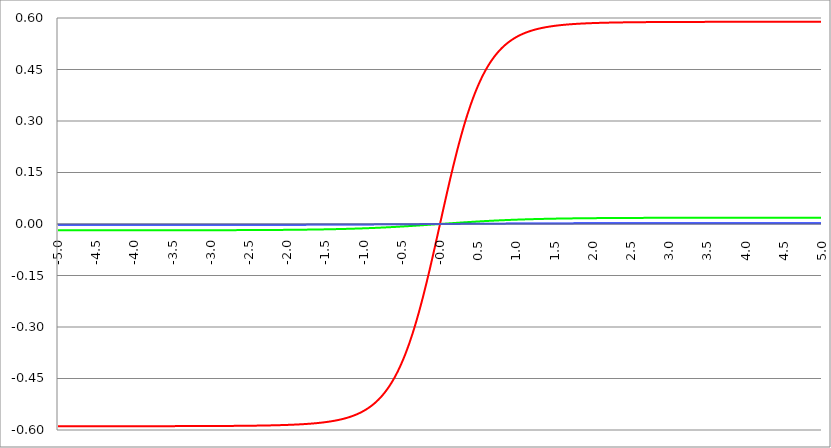
| Category | Series 1 | Series 0 | Series 2 |
|---|---|---|---|
| -5.0 | -0.589 | -0.018 | -0.002 |
| -4.995 | -0.589 | -0.018 | -0.002 |
| -4.99 | -0.589 | -0.018 | -0.002 |
| -4.985 | -0.589 | -0.018 | -0.002 |
| -4.98 | -0.589 | -0.018 | -0.002 |
| -4.975 | -0.589 | -0.018 | -0.002 |
| -4.97 | -0.589 | -0.018 | -0.002 |
| -4.965000000000001 | -0.589 | -0.018 | -0.002 |
| -4.960000000000001 | -0.589 | -0.018 | -0.002 |
| -4.955000000000001 | -0.589 | -0.018 | -0.002 |
| -4.950000000000001 | -0.589 | -0.018 | -0.002 |
| -4.945000000000001 | -0.589 | -0.018 | -0.002 |
| -4.940000000000001 | -0.589 | -0.018 | -0.002 |
| -4.935000000000001 | -0.589 | -0.018 | -0.002 |
| -4.930000000000001 | -0.589 | -0.018 | -0.002 |
| -4.925000000000002 | -0.589 | -0.018 | -0.002 |
| -4.920000000000002 | -0.589 | -0.018 | -0.002 |
| -4.915000000000002 | -0.589 | -0.018 | -0.002 |
| -4.910000000000002 | -0.589 | -0.018 | -0.002 |
| -4.905000000000002 | -0.589 | -0.018 | -0.002 |
| -4.900000000000002 | -0.589 | -0.018 | -0.002 |
| -4.895000000000002 | -0.589 | -0.018 | -0.002 |
| -4.890000000000002 | -0.589 | -0.018 | -0.002 |
| -4.885000000000002 | -0.589 | -0.018 | -0.002 |
| -4.880000000000002 | -0.589 | -0.018 | -0.002 |
| -4.875000000000003 | -0.589 | -0.018 | -0.002 |
| -4.870000000000003 | -0.589 | -0.018 | -0.002 |
| -4.865000000000003 | -0.589 | -0.018 | -0.002 |
| -4.860000000000003 | -0.589 | -0.018 | -0.002 |
| -4.855000000000003 | -0.589 | -0.018 | -0.002 |
| -4.850000000000003 | -0.589 | -0.018 | -0.002 |
| -4.845000000000003 | -0.589 | -0.018 | -0.002 |
| -4.840000000000003 | -0.589 | -0.018 | -0.002 |
| -4.835000000000003 | -0.589 | -0.018 | -0.002 |
| -4.830000000000004 | -0.589 | -0.018 | -0.002 |
| -4.825000000000004 | -0.589 | -0.018 | -0.002 |
| -4.820000000000004 | -0.589 | -0.018 | -0.002 |
| -4.815000000000004 | -0.589 | -0.018 | -0.002 |
| -4.810000000000004 | -0.589 | -0.018 | -0.002 |
| -4.805000000000004 | -0.589 | -0.018 | -0.002 |
| -4.800000000000004 | -0.589 | -0.018 | -0.002 |
| -4.795000000000004 | -0.589 | -0.018 | -0.002 |
| -4.790000000000004 | -0.589 | -0.018 | -0.002 |
| -4.785000000000004 | -0.589 | -0.018 | -0.002 |
| -4.780000000000004 | -0.589 | -0.018 | -0.002 |
| -4.775000000000004 | -0.589 | -0.018 | -0.002 |
| -4.770000000000004 | -0.589 | -0.018 | -0.002 |
| -4.765000000000005 | -0.589 | -0.018 | -0.002 |
| -4.760000000000005 | -0.589 | -0.018 | -0.002 |
| -4.755000000000005 | -0.589 | -0.018 | -0.002 |
| -4.750000000000005 | -0.589 | -0.018 | -0.002 |
| -4.745000000000005 | -0.589 | -0.018 | -0.002 |
| -4.740000000000005 | -0.589 | -0.018 | -0.002 |
| -4.735000000000005 | -0.589 | -0.018 | -0.002 |
| -4.730000000000005 | -0.589 | -0.018 | -0.002 |
| -4.725000000000006 | -0.589 | -0.018 | -0.002 |
| -4.720000000000006 | -0.589 | -0.018 | -0.002 |
| -4.715000000000006 | -0.589 | -0.018 | -0.002 |
| -4.710000000000006 | -0.589 | -0.018 | -0.002 |
| -4.705000000000006 | -0.589 | -0.018 | -0.002 |
| -4.700000000000006 | -0.589 | -0.018 | -0.002 |
| -4.695000000000006 | -0.589 | -0.018 | -0.002 |
| -4.690000000000006 | -0.589 | -0.018 | -0.002 |
| -4.685000000000007 | -0.589 | -0.018 | -0.002 |
| -4.680000000000007 | -0.589 | -0.018 | -0.002 |
| -4.675000000000007 | -0.589 | -0.018 | -0.002 |
| -4.670000000000007 | -0.589 | -0.018 | -0.002 |
| -4.665000000000007 | -0.589 | -0.018 | -0.002 |
| -4.660000000000007 | -0.589 | -0.018 | -0.002 |
| -4.655000000000007 | -0.589 | -0.018 | -0.002 |
| -4.650000000000007 | -0.589 | -0.018 | -0.002 |
| -4.645000000000007 | -0.589 | -0.018 | -0.002 |
| -4.640000000000008 | -0.589 | -0.018 | -0.002 |
| -4.635000000000008 | -0.589 | -0.018 | -0.002 |
| -4.630000000000008 | -0.589 | -0.018 | -0.002 |
| -4.625000000000008 | -0.589 | -0.018 | -0.002 |
| -4.620000000000008 | -0.589 | -0.018 | -0.002 |
| -4.615000000000008 | -0.589 | -0.018 | -0.002 |
| -4.610000000000008 | -0.589 | -0.018 | -0.002 |
| -4.605000000000008 | -0.589 | -0.018 | -0.002 |
| -4.600000000000008 | -0.589 | -0.018 | -0.002 |
| -4.595000000000009 | -0.589 | -0.018 | -0.002 |
| -4.590000000000009 | -0.589 | -0.018 | -0.002 |
| -4.585000000000009 | -0.589 | -0.018 | -0.002 |
| -4.580000000000009 | -0.589 | -0.018 | -0.002 |
| -4.57500000000001 | -0.589 | -0.018 | -0.002 |
| -4.57000000000001 | -0.589 | -0.018 | -0.002 |
| -4.565000000000009 | -0.589 | -0.018 | -0.002 |
| -4.560000000000009 | -0.589 | -0.018 | -0.002 |
| -4.555000000000009 | -0.589 | -0.018 | -0.002 |
| -4.55000000000001 | -0.589 | -0.018 | -0.002 |
| -4.54500000000001 | -0.589 | -0.018 | -0.002 |
| -4.54000000000001 | -0.589 | -0.018 | -0.002 |
| -4.53500000000001 | -0.589 | -0.018 | -0.002 |
| -4.53000000000001 | -0.589 | -0.018 | -0.002 |
| -4.52500000000001 | -0.589 | -0.018 | -0.002 |
| -4.52000000000001 | -0.589 | -0.018 | -0.002 |
| -4.51500000000001 | -0.589 | -0.018 | -0.002 |
| -4.51000000000001 | -0.589 | -0.018 | -0.002 |
| -4.505000000000011 | -0.589 | -0.018 | -0.002 |
| -4.500000000000011 | -0.589 | -0.018 | -0.002 |
| -4.495000000000011 | -0.589 | -0.018 | -0.002 |
| -4.490000000000011 | -0.589 | -0.018 | -0.002 |
| -4.485000000000011 | -0.589 | -0.018 | -0.002 |
| -4.480000000000011 | -0.589 | -0.018 | -0.002 |
| -4.475000000000011 | -0.589 | -0.018 | -0.002 |
| -4.470000000000011 | -0.589 | -0.018 | -0.002 |
| -4.465000000000011 | -0.589 | -0.018 | -0.002 |
| -4.460000000000011 | -0.589 | -0.018 | -0.002 |
| -4.455000000000012 | -0.589 | -0.018 | -0.002 |
| -4.450000000000012 | -0.589 | -0.018 | -0.002 |
| -4.445000000000012 | -0.589 | -0.018 | -0.002 |
| -4.440000000000012 | -0.589 | -0.018 | -0.002 |
| -4.435000000000012 | -0.589 | -0.018 | -0.002 |
| -4.430000000000012 | -0.589 | -0.018 | -0.002 |
| -4.425000000000012 | -0.589 | -0.018 | -0.002 |
| -4.420000000000012 | -0.589 | -0.018 | -0.002 |
| -4.415000000000012 | -0.589 | -0.018 | -0.002 |
| -4.410000000000013 | -0.589 | -0.018 | -0.002 |
| -4.405000000000013 | -0.589 | -0.018 | -0.002 |
| -4.400000000000013 | -0.589 | -0.018 | -0.002 |
| -4.395000000000013 | -0.589 | -0.018 | -0.002 |
| -4.390000000000013 | -0.589 | -0.018 | -0.002 |
| -4.385000000000013 | -0.589 | -0.018 | -0.002 |
| -4.380000000000013 | -0.589 | -0.018 | -0.002 |
| -4.375000000000013 | -0.589 | -0.018 | -0.002 |
| -4.370000000000013 | -0.589 | -0.018 | -0.002 |
| -4.365000000000013 | -0.589 | -0.018 | -0.002 |
| -4.360000000000014 | -0.589 | -0.018 | -0.002 |
| -4.355000000000014 | -0.589 | -0.018 | -0.002 |
| -4.350000000000014 | -0.589 | -0.018 | -0.002 |
| -4.345000000000014 | -0.589 | -0.018 | -0.002 |
| -4.340000000000014 | -0.589 | -0.018 | -0.002 |
| -4.335000000000014 | -0.589 | -0.018 | -0.002 |
| -4.330000000000014 | -0.589 | -0.018 | -0.002 |
| -4.325000000000014 | -0.589 | -0.018 | -0.002 |
| -4.320000000000014 | -0.589 | -0.018 | -0.002 |
| -4.315000000000015 | -0.589 | -0.018 | -0.002 |
| -4.310000000000015 | -0.589 | -0.018 | -0.002 |
| -4.305000000000015 | -0.589 | -0.018 | -0.002 |
| -4.300000000000015 | -0.589 | -0.018 | -0.002 |
| -4.295000000000015 | -0.589 | -0.018 | -0.002 |
| -4.290000000000015 | -0.589 | -0.018 | -0.002 |
| -4.285000000000015 | -0.589 | -0.018 | -0.002 |
| -4.280000000000015 | -0.589 | -0.018 | -0.002 |
| -4.275000000000015 | -0.589 | -0.018 | -0.002 |
| -4.270000000000015 | -0.589 | -0.018 | -0.002 |
| -4.265000000000016 | -0.589 | -0.018 | -0.002 |
| -4.260000000000016 | -0.589 | -0.018 | -0.002 |
| -4.255000000000016 | -0.589 | -0.018 | -0.002 |
| -4.250000000000016 | -0.589 | -0.018 | -0.002 |
| -4.245000000000016 | -0.589 | -0.018 | -0.002 |
| -4.240000000000016 | -0.589 | -0.018 | -0.002 |
| -4.235000000000016 | -0.589 | -0.018 | -0.002 |
| -4.230000000000016 | -0.589 | -0.018 | -0.002 |
| -4.225000000000017 | -0.589 | -0.018 | -0.002 |
| -4.220000000000017 | -0.589 | -0.018 | -0.002 |
| -4.215000000000017 | -0.589 | -0.018 | -0.002 |
| -4.210000000000017 | -0.589 | -0.018 | -0.002 |
| -4.205000000000017 | -0.589 | -0.018 | -0.002 |
| -4.200000000000017 | -0.589 | -0.018 | -0.002 |
| -4.195000000000017 | -0.589 | -0.018 | -0.002 |
| -4.190000000000017 | -0.589 | -0.018 | -0.002 |
| -4.185000000000017 | -0.589 | -0.018 | -0.002 |
| -4.180000000000017 | -0.589 | -0.018 | -0.002 |
| -4.175000000000018 | -0.589 | -0.018 | -0.002 |
| -4.170000000000018 | -0.589 | -0.018 | -0.002 |
| -4.165000000000018 | -0.589 | -0.018 | -0.002 |
| -4.160000000000018 | -0.589 | -0.018 | -0.002 |
| -4.155000000000018 | -0.589 | -0.018 | -0.002 |
| -4.150000000000018 | -0.589 | -0.018 | -0.002 |
| -4.145000000000018 | -0.589 | -0.018 | -0.002 |
| -4.140000000000018 | -0.589 | -0.018 | -0.002 |
| -4.135000000000018 | -0.589 | -0.018 | -0.002 |
| -4.130000000000019 | -0.589 | -0.018 | -0.002 |
| -4.125000000000019 | -0.589 | -0.018 | -0.002 |
| -4.120000000000019 | -0.589 | -0.018 | -0.002 |
| -4.115000000000019 | -0.589 | -0.018 | -0.002 |
| -4.110000000000019 | -0.589 | -0.018 | -0.002 |
| -4.105000000000019 | -0.589 | -0.018 | -0.002 |
| -4.100000000000019 | -0.589 | -0.018 | -0.002 |
| -4.095000000000019 | -0.589 | -0.018 | -0.002 |
| -4.090000000000019 | -0.589 | -0.018 | -0.002 |
| -4.085000000000019 | -0.589 | -0.018 | -0.002 |
| -4.08000000000002 | -0.589 | -0.018 | -0.002 |
| -4.07500000000002 | -0.589 | -0.018 | -0.002 |
| -4.07000000000002 | -0.589 | -0.018 | -0.002 |
| -4.06500000000002 | -0.589 | -0.018 | -0.002 |
| -4.06000000000002 | -0.589 | -0.018 | -0.002 |
| -4.05500000000002 | -0.589 | -0.018 | -0.002 |
| -4.05000000000002 | -0.589 | -0.018 | -0.002 |
| -4.04500000000002 | -0.589 | -0.018 | -0.002 |
| -4.04000000000002 | -0.589 | -0.018 | -0.002 |
| -4.03500000000002 | -0.589 | -0.018 | -0.002 |
| -4.03000000000002 | -0.589 | -0.018 | -0.002 |
| -4.025000000000021 | -0.589 | -0.018 | -0.002 |
| -4.020000000000021 | -0.589 | -0.018 | -0.002 |
| -4.015000000000021 | -0.589 | -0.018 | -0.002 |
| -4.010000000000021 | -0.589 | -0.018 | -0.002 |
| -4.005000000000021 | -0.589 | -0.018 | -0.002 |
| -4.000000000000021 | -0.589 | -0.018 | -0.002 |
| -3.995000000000021 | -0.589 | -0.018 | -0.002 |
| -3.990000000000021 | -0.589 | -0.018 | -0.002 |
| -3.985000000000022 | -0.589 | -0.018 | -0.002 |
| -3.980000000000022 | -0.589 | -0.018 | -0.002 |
| -3.975000000000022 | -0.589 | -0.018 | -0.002 |
| -3.970000000000022 | -0.589 | -0.018 | -0.002 |
| -3.965000000000022 | -0.589 | -0.018 | -0.002 |
| -3.960000000000022 | -0.589 | -0.018 | -0.002 |
| -3.955000000000022 | -0.589 | -0.018 | -0.002 |
| -3.950000000000022 | -0.589 | -0.018 | -0.002 |
| -3.945000000000022 | -0.589 | -0.018 | -0.002 |
| -3.940000000000023 | -0.589 | -0.018 | -0.002 |
| -3.935000000000023 | -0.589 | -0.018 | -0.002 |
| -3.930000000000023 | -0.589 | -0.018 | -0.002 |
| -3.925000000000023 | -0.589 | -0.018 | -0.002 |
| -3.920000000000023 | -0.589 | -0.018 | -0.002 |
| -3.915000000000023 | -0.589 | -0.018 | -0.002 |
| -3.910000000000023 | -0.589 | -0.018 | -0.002 |
| -3.905000000000023 | -0.589 | -0.018 | -0.002 |
| -3.900000000000023 | -0.589 | -0.018 | -0.002 |
| -3.895000000000023 | -0.589 | -0.018 | -0.002 |
| -3.890000000000024 | -0.589 | -0.018 | -0.002 |
| -3.885000000000024 | -0.589 | -0.018 | -0.002 |
| -3.880000000000024 | -0.589 | -0.018 | -0.002 |
| -3.875000000000024 | -0.589 | -0.018 | -0.002 |
| -3.870000000000024 | -0.589 | -0.018 | -0.002 |
| -3.865000000000024 | -0.589 | -0.018 | -0.002 |
| -3.860000000000024 | -0.589 | -0.018 | -0.002 |
| -3.855000000000024 | -0.589 | -0.018 | -0.002 |
| -3.850000000000024 | -0.589 | -0.018 | -0.002 |
| -3.845000000000025 | -0.589 | -0.018 | -0.002 |
| -3.840000000000025 | -0.589 | -0.018 | -0.002 |
| -3.835000000000025 | -0.589 | -0.018 | -0.002 |
| -3.830000000000025 | -0.589 | -0.018 | -0.002 |
| -3.825000000000025 | -0.589 | -0.018 | -0.002 |
| -3.820000000000025 | -0.589 | -0.018 | -0.002 |
| -3.815000000000025 | -0.589 | -0.018 | -0.002 |
| -3.810000000000025 | -0.589 | -0.018 | -0.002 |
| -3.805000000000025 | -0.589 | -0.018 | -0.002 |
| -3.800000000000026 | -0.589 | -0.018 | -0.002 |
| -3.795000000000026 | -0.589 | -0.018 | -0.002 |
| -3.790000000000026 | -0.589 | -0.018 | -0.002 |
| -3.785000000000026 | -0.589 | -0.018 | -0.002 |
| -3.780000000000026 | -0.589 | -0.018 | -0.002 |
| -3.775000000000026 | -0.589 | -0.018 | -0.002 |
| -3.770000000000026 | -0.589 | -0.018 | -0.002 |
| -3.765000000000026 | -0.589 | -0.018 | -0.002 |
| -3.760000000000026 | -0.589 | -0.018 | -0.002 |
| -3.755000000000026 | -0.589 | -0.018 | -0.002 |
| -3.750000000000027 | -0.589 | -0.018 | -0.002 |
| -3.745000000000027 | -0.589 | -0.018 | -0.002 |
| -3.740000000000027 | -0.589 | -0.018 | -0.002 |
| -3.735000000000027 | -0.589 | -0.018 | -0.002 |
| -3.730000000000027 | -0.589 | -0.018 | -0.002 |
| -3.725000000000027 | -0.589 | -0.018 | -0.002 |
| -3.720000000000027 | -0.589 | -0.018 | -0.002 |
| -3.715000000000027 | -0.589 | -0.018 | -0.002 |
| -3.710000000000027 | -0.589 | -0.018 | -0.002 |
| -3.705000000000028 | -0.589 | -0.018 | -0.002 |
| -3.700000000000028 | -0.589 | -0.018 | -0.002 |
| -3.695000000000028 | -0.589 | -0.018 | -0.002 |
| -3.690000000000028 | -0.589 | -0.018 | -0.002 |
| -3.685000000000028 | -0.589 | -0.018 | -0.002 |
| -3.680000000000028 | -0.589 | -0.018 | -0.002 |
| -3.675000000000028 | -0.589 | -0.018 | -0.002 |
| -3.670000000000028 | -0.589 | -0.018 | -0.002 |
| -3.665000000000028 | -0.589 | -0.018 | -0.002 |
| -3.660000000000028 | -0.589 | -0.018 | -0.002 |
| -3.655000000000029 | -0.589 | -0.018 | -0.002 |
| -3.650000000000029 | -0.589 | -0.018 | -0.002 |
| -3.645000000000029 | -0.589 | -0.018 | -0.002 |
| -3.640000000000029 | -0.589 | -0.018 | -0.002 |
| -3.635000000000029 | -0.589 | -0.018 | -0.002 |
| -3.630000000000029 | -0.589 | -0.018 | -0.002 |
| -3.625000000000029 | -0.589 | -0.018 | -0.002 |
| -3.620000000000029 | -0.589 | -0.018 | -0.002 |
| -3.615000000000029 | -0.589 | -0.018 | -0.002 |
| -3.61000000000003 | -0.589 | -0.018 | -0.002 |
| -3.60500000000003 | -0.589 | -0.018 | -0.002 |
| -3.60000000000003 | -0.589 | -0.018 | -0.002 |
| -3.59500000000003 | -0.589 | -0.018 | -0.002 |
| -3.59000000000003 | -0.589 | -0.018 | -0.002 |
| -3.58500000000003 | -0.589 | -0.018 | -0.002 |
| -3.58000000000003 | -0.589 | -0.018 | -0.002 |
| -3.57500000000003 | -0.589 | -0.018 | -0.002 |
| -3.57000000000003 | -0.589 | -0.018 | -0.002 |
| -3.565000000000031 | -0.589 | -0.018 | -0.002 |
| -3.560000000000031 | -0.589 | -0.018 | -0.002 |
| -3.555000000000031 | -0.589 | -0.018 | -0.002 |
| -3.550000000000031 | -0.589 | -0.018 | -0.002 |
| -3.545000000000031 | -0.589 | -0.018 | -0.002 |
| -3.540000000000031 | -0.589 | -0.018 | -0.002 |
| -3.535000000000031 | -0.589 | -0.018 | -0.002 |
| -3.530000000000031 | -0.589 | -0.018 | -0.002 |
| -3.525000000000031 | -0.589 | -0.018 | -0.002 |
| -3.520000000000032 | -0.589 | -0.018 | -0.002 |
| -3.515000000000032 | -0.589 | -0.018 | -0.002 |
| -3.510000000000032 | -0.589 | -0.018 | -0.002 |
| -3.505000000000032 | -0.589 | -0.018 | -0.002 |
| -3.500000000000032 | -0.589 | -0.018 | -0.002 |
| -3.495000000000032 | -0.589 | -0.018 | -0.002 |
| -3.490000000000032 | -0.589 | -0.018 | -0.002 |
| -3.485000000000032 | -0.589 | -0.018 | -0.002 |
| -3.480000000000032 | -0.589 | -0.018 | -0.002 |
| -3.475000000000032 | -0.589 | -0.018 | -0.002 |
| -3.470000000000033 | -0.589 | -0.018 | -0.002 |
| -3.465000000000033 | -0.589 | -0.018 | -0.002 |
| -3.460000000000033 | -0.589 | -0.018 | -0.002 |
| -3.455000000000033 | -0.589 | -0.018 | -0.002 |
| -3.450000000000033 | -0.589 | -0.018 | -0.002 |
| -3.445000000000033 | -0.589 | -0.018 | -0.002 |
| -3.440000000000033 | -0.589 | -0.018 | -0.002 |
| -3.435000000000033 | -0.589 | -0.018 | -0.002 |
| -3.430000000000033 | -0.589 | -0.018 | -0.002 |
| -3.425000000000034 | -0.589 | -0.018 | -0.002 |
| -3.420000000000034 | -0.589 | -0.018 | -0.002 |
| -3.415000000000034 | -0.589 | -0.018 | -0.002 |
| -3.410000000000034 | -0.589 | -0.018 | -0.002 |
| -3.405000000000034 | -0.589 | -0.018 | -0.002 |
| -3.400000000000034 | -0.589 | -0.018 | -0.002 |
| -3.395000000000034 | -0.589 | -0.018 | -0.002 |
| -3.390000000000034 | -0.589 | -0.018 | -0.002 |
| -3.385000000000034 | -0.589 | -0.018 | -0.002 |
| -3.380000000000034 | -0.589 | -0.018 | -0.002 |
| -3.375000000000035 | -0.589 | -0.018 | -0.002 |
| -3.370000000000035 | -0.589 | -0.018 | -0.002 |
| -3.365000000000035 | -0.589 | -0.018 | -0.002 |
| -3.360000000000035 | -0.589 | -0.018 | -0.002 |
| -3.355000000000035 | -0.589 | -0.018 | -0.002 |
| -3.350000000000035 | -0.589 | -0.018 | -0.002 |
| -3.345000000000035 | -0.589 | -0.018 | -0.002 |
| -3.340000000000035 | -0.589 | -0.018 | -0.002 |
| -3.335000000000035 | -0.589 | -0.018 | -0.002 |
| -3.330000000000036 | -0.589 | -0.018 | -0.002 |
| -3.325000000000036 | -0.589 | -0.018 | -0.002 |
| -3.320000000000036 | -0.589 | -0.018 | -0.002 |
| -3.315000000000036 | -0.589 | -0.018 | -0.002 |
| -3.310000000000036 | -0.589 | -0.018 | -0.002 |
| -3.305000000000036 | -0.589 | -0.018 | -0.002 |
| -3.300000000000036 | -0.589 | -0.018 | -0.002 |
| -3.295000000000036 | -0.589 | -0.018 | -0.002 |
| -3.290000000000036 | -0.589 | -0.018 | -0.002 |
| -3.285000000000036 | -0.589 | -0.018 | -0.002 |
| -3.280000000000036 | -0.589 | -0.018 | -0.002 |
| -3.275000000000037 | -0.589 | -0.018 | -0.002 |
| -3.270000000000037 | -0.589 | -0.018 | -0.002 |
| -3.265000000000037 | -0.589 | -0.018 | -0.002 |
| -3.260000000000037 | -0.589 | -0.018 | -0.002 |
| -3.255000000000037 | -0.589 | -0.018 | -0.002 |
| -3.250000000000037 | -0.589 | -0.018 | -0.002 |
| -3.245000000000037 | -0.589 | -0.018 | -0.002 |
| -3.240000000000037 | -0.589 | -0.018 | -0.002 |
| -3.235000000000038 | -0.589 | -0.018 | -0.002 |
| -3.230000000000038 | -0.589 | -0.018 | -0.002 |
| -3.225000000000038 | -0.589 | -0.018 | -0.002 |
| -3.220000000000038 | -0.589 | -0.018 | -0.002 |
| -3.215000000000038 | -0.589 | -0.018 | -0.002 |
| -3.210000000000038 | -0.589 | -0.018 | -0.002 |
| -3.205000000000038 | -0.589 | -0.018 | -0.002 |
| -3.200000000000038 | -0.589 | -0.018 | -0.002 |
| -3.195000000000038 | -0.589 | -0.018 | -0.002 |
| -3.190000000000039 | -0.589 | -0.018 | -0.002 |
| -3.185000000000039 | -0.589 | -0.018 | -0.002 |
| -3.180000000000039 | -0.589 | -0.018 | -0.002 |
| -3.175000000000039 | -0.589 | -0.018 | -0.002 |
| -3.170000000000039 | -0.589 | -0.018 | -0.002 |
| -3.16500000000004 | -0.589 | -0.018 | -0.002 |
| -3.16000000000004 | -0.589 | -0.018 | -0.002 |
| -3.155000000000039 | -0.589 | -0.018 | -0.002 |
| -3.150000000000039 | -0.589 | -0.018 | -0.002 |
| -3.14500000000004 | -0.589 | -0.018 | -0.002 |
| -3.14000000000004 | -0.589 | -0.018 | -0.002 |
| -3.13500000000004 | -0.589 | -0.018 | -0.002 |
| -3.13000000000004 | -0.589 | -0.018 | -0.002 |
| -3.12500000000004 | -0.589 | -0.018 | -0.002 |
| -3.12000000000004 | -0.589 | -0.018 | -0.002 |
| -3.11500000000004 | -0.588 | -0.018 | -0.002 |
| -3.11000000000004 | -0.588 | -0.018 | -0.002 |
| -3.10500000000004 | -0.588 | -0.018 | -0.002 |
| -3.10000000000004 | -0.588 | -0.018 | -0.002 |
| -3.095000000000041 | -0.588 | -0.018 | -0.002 |
| -3.090000000000041 | -0.588 | -0.018 | -0.002 |
| -3.085000000000041 | -0.588 | -0.018 | -0.002 |
| -3.080000000000041 | -0.588 | -0.018 | -0.002 |
| -3.075000000000041 | -0.588 | -0.018 | -0.002 |
| -3.070000000000041 | -0.588 | -0.018 | -0.002 |
| -3.065000000000041 | -0.588 | -0.018 | -0.002 |
| -3.060000000000041 | -0.588 | -0.018 | -0.002 |
| -3.055000000000041 | -0.588 | -0.018 | -0.002 |
| -3.050000000000042 | -0.588 | -0.018 | -0.002 |
| -3.045000000000042 | -0.588 | -0.018 | -0.002 |
| -3.040000000000042 | -0.588 | -0.018 | -0.002 |
| -3.035000000000042 | -0.588 | -0.018 | -0.002 |
| -3.030000000000042 | -0.588 | -0.018 | -0.002 |
| -3.025000000000042 | -0.588 | -0.018 | -0.002 |
| -3.020000000000042 | -0.588 | -0.018 | -0.002 |
| -3.015000000000042 | -0.588 | -0.018 | -0.002 |
| -3.010000000000042 | -0.588 | -0.018 | -0.002 |
| -3.005000000000043 | -0.588 | -0.018 | -0.002 |
| -3.000000000000043 | -0.588 | -0.018 | -0.002 |
| -2.995000000000043 | -0.588 | -0.018 | -0.002 |
| -2.990000000000043 | -0.588 | -0.018 | -0.002 |
| -2.985000000000043 | -0.588 | -0.018 | -0.002 |
| -2.980000000000043 | -0.588 | -0.018 | -0.002 |
| -2.975000000000043 | -0.588 | -0.018 | -0.002 |
| -2.970000000000043 | -0.588 | -0.018 | -0.002 |
| -2.965000000000043 | -0.588 | -0.018 | -0.002 |
| -2.960000000000043 | -0.588 | -0.018 | -0.002 |
| -2.955000000000044 | -0.588 | -0.018 | -0.002 |
| -2.950000000000044 | -0.588 | -0.018 | -0.002 |
| -2.945000000000044 | -0.588 | -0.018 | -0.002 |
| -2.940000000000044 | -0.588 | -0.018 | -0.002 |
| -2.935000000000044 | -0.588 | -0.018 | -0.002 |
| -2.930000000000044 | -0.588 | -0.018 | -0.002 |
| -2.925000000000044 | -0.588 | -0.018 | -0.002 |
| -2.920000000000044 | -0.588 | -0.018 | -0.002 |
| -2.915000000000044 | -0.588 | -0.018 | -0.002 |
| -2.910000000000045 | -0.588 | -0.018 | -0.002 |
| -2.905000000000045 | -0.588 | -0.018 | -0.002 |
| -2.900000000000045 | -0.588 | -0.018 | -0.002 |
| -2.895000000000045 | -0.588 | -0.018 | -0.002 |
| -2.890000000000045 | -0.588 | -0.018 | -0.002 |
| -2.885000000000045 | -0.588 | -0.018 | -0.002 |
| -2.880000000000045 | -0.588 | -0.018 | -0.002 |
| -2.875000000000045 | -0.588 | -0.018 | -0.002 |
| -2.870000000000045 | -0.588 | -0.018 | -0.002 |
| -2.865000000000045 | -0.588 | -0.018 | -0.002 |
| -2.860000000000046 | -0.588 | -0.018 | -0.002 |
| -2.855000000000046 | -0.588 | -0.018 | -0.002 |
| -2.850000000000046 | -0.588 | -0.018 | -0.002 |
| -2.845000000000046 | -0.588 | -0.018 | -0.002 |
| -2.840000000000046 | -0.588 | -0.018 | -0.002 |
| -2.835000000000046 | -0.588 | -0.018 | -0.002 |
| -2.830000000000046 | -0.588 | -0.018 | -0.002 |
| -2.825000000000046 | -0.588 | -0.018 | -0.002 |
| -2.820000000000046 | -0.588 | -0.018 | -0.002 |
| -2.815000000000047 | -0.588 | -0.018 | -0.002 |
| -2.810000000000047 | -0.588 | -0.018 | -0.002 |
| -2.805000000000047 | -0.588 | -0.018 | -0.002 |
| -2.800000000000047 | -0.588 | -0.018 | -0.002 |
| -2.795000000000047 | -0.588 | -0.018 | -0.002 |
| -2.790000000000047 | -0.588 | -0.018 | -0.002 |
| -2.785000000000047 | -0.588 | -0.018 | -0.002 |
| -2.780000000000047 | -0.588 | -0.018 | -0.002 |
| -2.775000000000047 | -0.588 | -0.018 | -0.002 |
| -2.770000000000047 | -0.588 | -0.018 | -0.002 |
| -2.765000000000048 | -0.588 | -0.018 | -0.002 |
| -2.760000000000048 | -0.588 | -0.018 | -0.002 |
| -2.755000000000048 | -0.588 | -0.018 | -0.002 |
| -2.750000000000048 | -0.588 | -0.018 | -0.002 |
| -2.745000000000048 | -0.588 | -0.018 | -0.002 |
| -2.740000000000048 | -0.588 | -0.018 | -0.002 |
| -2.735000000000048 | -0.588 | -0.018 | -0.002 |
| -2.730000000000048 | -0.588 | -0.018 | -0.002 |
| -2.725000000000048 | -0.588 | -0.018 | -0.002 |
| -2.720000000000049 | -0.588 | -0.018 | -0.002 |
| -2.715000000000049 | -0.588 | -0.018 | -0.002 |
| -2.710000000000049 | -0.588 | -0.018 | -0.002 |
| -2.705000000000049 | -0.588 | -0.018 | -0.002 |
| -2.700000000000049 | -0.588 | -0.018 | -0.002 |
| -2.695000000000049 | -0.588 | -0.018 | -0.002 |
| -2.690000000000049 | -0.588 | -0.018 | -0.002 |
| -2.685000000000049 | -0.588 | -0.018 | -0.002 |
| -2.680000000000049 | -0.588 | -0.018 | -0.002 |
| -2.675000000000049 | -0.588 | -0.018 | -0.002 |
| -2.67000000000005 | -0.588 | -0.018 | -0.002 |
| -2.66500000000005 | -0.588 | -0.018 | -0.002 |
| -2.66000000000005 | -0.588 | -0.018 | -0.002 |
| -2.65500000000005 | -0.588 | -0.018 | -0.002 |
| -2.65000000000005 | -0.588 | -0.018 | -0.002 |
| -2.64500000000005 | -0.588 | -0.018 | -0.002 |
| -2.64000000000005 | -0.588 | -0.018 | -0.002 |
| -2.63500000000005 | -0.588 | -0.018 | -0.002 |
| -2.63000000000005 | -0.588 | -0.018 | -0.002 |
| -2.625000000000051 | -0.588 | -0.018 | -0.002 |
| -2.620000000000051 | -0.588 | -0.018 | -0.002 |
| -2.615000000000051 | -0.588 | -0.018 | -0.002 |
| -2.610000000000051 | -0.588 | -0.018 | -0.002 |
| -2.605000000000051 | -0.588 | -0.018 | -0.002 |
| -2.600000000000051 | -0.588 | -0.018 | -0.002 |
| -2.595000000000051 | -0.588 | -0.018 | -0.002 |
| -2.590000000000051 | -0.588 | -0.018 | -0.002 |
| -2.585000000000051 | -0.588 | -0.018 | -0.002 |
| -2.580000000000052 | -0.588 | -0.018 | -0.002 |
| -2.575000000000052 | -0.588 | -0.018 | -0.002 |
| -2.570000000000052 | -0.588 | -0.018 | -0.002 |
| -2.565000000000052 | -0.588 | -0.018 | -0.002 |
| -2.560000000000052 | -0.588 | -0.018 | -0.002 |
| -2.555000000000052 | -0.588 | -0.018 | -0.002 |
| -2.550000000000052 | -0.588 | -0.018 | -0.002 |
| -2.545000000000052 | -0.588 | -0.018 | -0.002 |
| -2.540000000000052 | -0.588 | -0.018 | -0.002 |
| -2.535000000000053 | -0.588 | -0.018 | -0.002 |
| -2.530000000000053 | -0.588 | -0.018 | -0.002 |
| -2.525000000000053 | -0.588 | -0.018 | -0.002 |
| -2.520000000000053 | -0.588 | -0.018 | -0.002 |
| -2.515000000000053 | -0.588 | -0.018 | -0.002 |
| -2.510000000000053 | -0.588 | -0.018 | -0.002 |
| -2.505000000000053 | -0.588 | -0.018 | -0.002 |
| -2.500000000000053 | -0.588 | -0.018 | -0.002 |
| -2.495000000000053 | -0.588 | -0.018 | -0.002 |
| -2.490000000000053 | -0.588 | -0.018 | -0.002 |
| -2.485000000000054 | -0.588 | -0.018 | -0.002 |
| -2.480000000000054 | -0.588 | -0.018 | -0.002 |
| -2.475000000000054 | -0.587 | -0.018 | -0.002 |
| -2.470000000000054 | -0.587 | -0.018 | -0.002 |
| -2.465000000000054 | -0.587 | -0.018 | -0.002 |
| -2.460000000000054 | -0.587 | -0.018 | -0.002 |
| -2.455000000000054 | -0.587 | -0.018 | -0.002 |
| -2.450000000000054 | -0.587 | -0.018 | -0.002 |
| -2.445000000000054 | -0.587 | -0.018 | -0.002 |
| -2.440000000000055 | -0.587 | -0.018 | -0.002 |
| -2.435000000000055 | -0.587 | -0.018 | -0.002 |
| -2.430000000000055 | -0.587 | -0.018 | -0.002 |
| -2.425000000000055 | -0.587 | -0.018 | -0.002 |
| -2.420000000000055 | -0.587 | -0.018 | -0.002 |
| -2.415000000000055 | -0.587 | -0.018 | -0.002 |
| -2.410000000000055 | -0.587 | -0.018 | -0.002 |
| -2.405000000000055 | -0.587 | -0.018 | -0.002 |
| -2.400000000000055 | -0.587 | -0.018 | -0.002 |
| -2.395000000000055 | -0.587 | -0.018 | -0.002 |
| -2.390000000000056 | -0.587 | -0.018 | -0.002 |
| -2.385000000000056 | -0.587 | -0.018 | -0.002 |
| -2.380000000000056 | -0.587 | -0.018 | -0.002 |
| -2.375000000000056 | -0.587 | -0.018 | -0.002 |
| -2.370000000000056 | -0.587 | -0.018 | -0.002 |
| -2.365000000000056 | -0.587 | -0.018 | -0.002 |
| -2.360000000000056 | -0.587 | -0.018 | -0.002 |
| -2.355000000000056 | -0.587 | -0.018 | -0.002 |
| -2.350000000000056 | -0.587 | -0.018 | -0.002 |
| -2.345000000000057 | -0.587 | -0.018 | -0.002 |
| -2.340000000000057 | -0.587 | -0.018 | -0.002 |
| -2.335000000000057 | -0.587 | -0.018 | -0.002 |
| -2.330000000000057 | -0.587 | -0.018 | -0.002 |
| -2.325000000000057 | -0.587 | -0.018 | -0.002 |
| -2.320000000000057 | -0.587 | -0.018 | -0.002 |
| -2.315000000000057 | -0.587 | -0.018 | -0.002 |
| -2.310000000000057 | -0.587 | -0.018 | -0.002 |
| -2.305000000000057 | -0.587 | -0.017 | -0.002 |
| -2.300000000000058 | -0.587 | -0.017 | -0.002 |
| -2.295000000000058 | -0.587 | -0.017 | -0.002 |
| -2.290000000000058 | -0.587 | -0.017 | -0.002 |
| -2.285000000000058 | -0.587 | -0.017 | -0.002 |
| -2.280000000000058 | -0.587 | -0.017 | -0.002 |
| -2.275000000000058 | -0.587 | -0.017 | -0.002 |
| -2.270000000000058 | -0.587 | -0.017 | -0.002 |
| -2.265000000000058 | -0.587 | -0.017 | -0.002 |
| -2.260000000000058 | -0.587 | -0.017 | -0.002 |
| -2.255000000000058 | -0.587 | -0.017 | -0.002 |
| -2.250000000000059 | -0.587 | -0.017 | -0.002 |
| -2.245000000000059 | -0.587 | -0.017 | -0.002 |
| -2.240000000000059 | -0.587 | -0.017 | -0.002 |
| -2.235000000000059 | -0.587 | -0.017 | -0.002 |
| -2.23000000000006 | -0.587 | -0.017 | -0.002 |
| -2.22500000000006 | -0.587 | -0.017 | -0.002 |
| -2.22000000000006 | -0.587 | -0.017 | -0.002 |
| -2.215000000000059 | -0.587 | -0.017 | -0.002 |
| -2.210000000000059 | -0.587 | -0.017 | -0.002 |
| -2.20500000000006 | -0.586 | -0.017 | -0.002 |
| -2.20000000000006 | -0.586 | -0.017 | -0.002 |
| -2.19500000000006 | -0.586 | -0.017 | -0.002 |
| -2.19000000000006 | -0.586 | -0.017 | -0.002 |
| -2.18500000000006 | -0.586 | -0.017 | -0.002 |
| -2.18000000000006 | -0.586 | -0.017 | -0.002 |
| -2.17500000000006 | -0.586 | -0.017 | -0.002 |
| -2.17000000000006 | -0.586 | -0.017 | -0.002 |
| -2.16500000000006 | -0.586 | -0.017 | -0.002 |
| -2.160000000000061 | -0.586 | -0.017 | -0.002 |
| -2.155000000000061 | -0.586 | -0.017 | -0.002 |
| -2.150000000000061 | -0.586 | -0.017 | -0.002 |
| -2.145000000000061 | -0.586 | -0.017 | -0.002 |
| -2.140000000000061 | -0.586 | -0.017 | -0.002 |
| -2.135000000000061 | -0.586 | -0.017 | -0.002 |
| -2.130000000000061 | -0.586 | -0.017 | -0.002 |
| -2.125000000000061 | -0.586 | -0.017 | -0.002 |
| -2.120000000000061 | -0.586 | -0.017 | -0.002 |
| -2.115000000000061 | -0.586 | -0.017 | -0.002 |
| -2.110000000000062 | -0.586 | -0.017 | -0.002 |
| -2.105000000000062 | -0.586 | -0.017 | -0.002 |
| -2.100000000000062 | -0.586 | -0.017 | -0.002 |
| -2.095000000000062 | -0.586 | -0.017 | -0.002 |
| -2.090000000000062 | -0.586 | -0.017 | -0.002 |
| -2.085000000000062 | -0.586 | -0.017 | -0.002 |
| -2.080000000000062 | -0.586 | -0.017 | -0.002 |
| -2.075000000000062 | -0.586 | -0.017 | -0.002 |
| -2.070000000000062 | -0.586 | -0.017 | -0.002 |
| -2.065000000000063 | -0.586 | -0.017 | -0.002 |
| -2.060000000000063 | -0.586 | -0.017 | -0.002 |
| -2.055000000000063 | -0.586 | -0.017 | -0.002 |
| -2.050000000000063 | -0.586 | -0.017 | -0.002 |
| -2.045000000000063 | -0.586 | -0.017 | -0.002 |
| -2.040000000000063 | -0.585 | -0.017 | -0.002 |
| -2.035000000000063 | -0.585 | -0.017 | -0.002 |
| -2.030000000000063 | -0.585 | -0.017 | -0.002 |
| -2.025000000000063 | -0.585 | -0.017 | -0.002 |
| -2.020000000000064 | -0.585 | -0.017 | -0.002 |
| -2.015000000000064 | -0.585 | -0.017 | -0.002 |
| -2.010000000000064 | -0.585 | -0.017 | -0.002 |
| -2.005000000000064 | -0.585 | -0.017 | -0.002 |
| -2.000000000000064 | -0.585 | -0.017 | -0.002 |
| -1.995000000000064 | -0.585 | -0.017 | -0.002 |
| -1.990000000000064 | -0.585 | -0.017 | -0.002 |
| -1.985000000000064 | -0.585 | -0.017 | -0.002 |
| -1.980000000000064 | -0.585 | -0.017 | -0.002 |
| -1.975000000000064 | -0.585 | -0.017 | -0.002 |
| -1.970000000000065 | -0.585 | -0.017 | -0.002 |
| -1.965000000000065 | -0.585 | -0.017 | -0.002 |
| -1.960000000000065 | -0.585 | -0.017 | -0.002 |
| -1.955000000000065 | -0.585 | -0.017 | -0.002 |
| -1.950000000000065 | -0.585 | -0.017 | -0.002 |
| -1.945000000000065 | -0.585 | -0.017 | -0.002 |
| -1.940000000000065 | -0.585 | -0.017 | -0.002 |
| -1.935000000000065 | -0.585 | -0.017 | -0.002 |
| -1.930000000000065 | -0.585 | -0.017 | -0.002 |
| -1.925000000000066 | -0.585 | -0.017 | -0.002 |
| -1.920000000000066 | -0.584 | -0.017 | -0.002 |
| -1.915000000000066 | -0.584 | -0.017 | -0.002 |
| -1.910000000000066 | -0.584 | -0.017 | -0.002 |
| -1.905000000000066 | -0.584 | -0.017 | -0.002 |
| -1.900000000000066 | -0.584 | -0.017 | -0.002 |
| -1.895000000000066 | -0.584 | -0.017 | -0.002 |
| -1.890000000000066 | -0.584 | -0.017 | -0.002 |
| -1.885000000000066 | -0.584 | -0.017 | -0.002 |
| -1.880000000000066 | -0.584 | -0.017 | -0.002 |
| -1.875000000000067 | -0.584 | -0.017 | -0.002 |
| -1.870000000000067 | -0.584 | -0.017 | -0.002 |
| -1.865000000000067 | -0.584 | -0.017 | -0.002 |
| -1.860000000000067 | -0.584 | -0.017 | -0.002 |
| -1.855000000000067 | -0.584 | -0.017 | -0.002 |
| -1.850000000000067 | -0.584 | -0.017 | -0.002 |
| -1.845000000000067 | -0.584 | -0.017 | -0.002 |
| -1.840000000000067 | -0.584 | -0.017 | -0.002 |
| -1.835000000000067 | -0.584 | -0.017 | -0.002 |
| -1.830000000000068 | -0.583 | -0.017 | -0.002 |
| -1.825000000000068 | -0.583 | -0.017 | -0.002 |
| -1.820000000000068 | -0.583 | -0.017 | -0.002 |
| -1.815000000000068 | -0.583 | -0.017 | -0.002 |
| -1.810000000000068 | -0.583 | -0.017 | -0.002 |
| -1.805000000000068 | -0.583 | -0.017 | -0.002 |
| -1.800000000000068 | -0.583 | -0.017 | -0.002 |
| -1.795000000000068 | -0.583 | -0.017 | -0.002 |
| -1.790000000000068 | -0.583 | -0.017 | -0.002 |
| -1.785000000000068 | -0.583 | -0.017 | -0.002 |
| -1.780000000000069 | -0.583 | -0.017 | -0.002 |
| -1.775000000000069 | -0.583 | -0.016 | -0.002 |
| -1.770000000000069 | -0.583 | -0.016 | -0.002 |
| -1.765000000000069 | -0.583 | -0.016 | -0.002 |
| -1.760000000000069 | -0.583 | -0.016 | -0.002 |
| -1.75500000000007 | -0.582 | -0.016 | -0.002 |
| -1.75000000000007 | -0.582 | -0.016 | -0.002 |
| -1.745000000000069 | -0.582 | -0.016 | -0.002 |
| -1.740000000000069 | -0.582 | -0.016 | -0.002 |
| -1.73500000000007 | -0.582 | -0.016 | -0.002 |
| -1.73000000000007 | -0.582 | -0.016 | -0.002 |
| -1.72500000000007 | -0.582 | -0.016 | -0.002 |
| -1.72000000000007 | -0.582 | -0.016 | -0.002 |
| -1.71500000000007 | -0.582 | -0.016 | -0.002 |
| -1.71000000000007 | -0.582 | -0.016 | -0.002 |
| -1.70500000000007 | -0.582 | -0.016 | -0.002 |
| -1.70000000000007 | -0.582 | -0.016 | -0.002 |
| -1.69500000000007 | -0.582 | -0.016 | -0.002 |
| -1.69000000000007 | -0.581 | -0.016 | -0.002 |
| -1.685000000000071 | -0.581 | -0.016 | -0.002 |
| -1.680000000000071 | -0.581 | -0.016 | -0.002 |
| -1.675000000000071 | -0.581 | -0.016 | -0.002 |
| -1.670000000000071 | -0.581 | -0.016 | -0.002 |
| -1.665000000000071 | -0.581 | -0.016 | -0.002 |
| -1.660000000000071 | -0.581 | -0.016 | -0.002 |
| -1.655000000000071 | -0.581 | -0.016 | -0.002 |
| -1.650000000000071 | -0.581 | -0.016 | -0.002 |
| -1.645000000000071 | -0.581 | -0.016 | -0.002 |
| -1.640000000000072 | -0.581 | -0.016 | -0.002 |
| -1.635000000000072 | -0.58 | -0.016 | -0.002 |
| -1.630000000000072 | -0.58 | -0.016 | -0.002 |
| -1.625000000000072 | -0.58 | -0.016 | -0.002 |
| -1.620000000000072 | -0.58 | -0.016 | -0.002 |
| -1.615000000000072 | -0.58 | -0.016 | -0.002 |
| -1.610000000000072 | -0.58 | -0.016 | -0.002 |
| -1.605000000000072 | -0.58 | -0.016 | -0.002 |
| -1.600000000000072 | -0.58 | -0.016 | -0.002 |
| -1.595000000000073 | -0.58 | -0.016 | -0.002 |
| -1.590000000000073 | -0.579 | -0.016 | -0.002 |
| -1.585000000000073 | -0.579 | -0.016 | -0.002 |
| -1.580000000000073 | -0.579 | -0.016 | -0.002 |
| -1.575000000000073 | -0.579 | -0.016 | -0.002 |
| -1.570000000000073 | -0.579 | -0.016 | -0.002 |
| -1.565000000000073 | -0.579 | -0.016 | -0.002 |
| -1.560000000000073 | -0.579 | -0.016 | -0.002 |
| -1.555000000000073 | -0.579 | -0.016 | -0.002 |
| -1.550000000000074 | -0.578 | -0.016 | -0.002 |
| -1.545000000000074 | -0.578 | -0.016 | -0.002 |
| -1.540000000000074 | -0.578 | -0.016 | -0.002 |
| -1.535000000000074 | -0.578 | -0.016 | -0.002 |
| -1.530000000000074 | -0.578 | -0.016 | -0.002 |
| -1.525000000000074 | -0.578 | -0.016 | -0.002 |
| -1.520000000000074 | -0.578 | -0.016 | -0.002 |
| -1.515000000000074 | -0.578 | -0.016 | -0.002 |
| -1.510000000000074 | -0.577 | -0.016 | -0.002 |
| -1.505000000000074 | -0.577 | -0.016 | -0.002 |
| -1.500000000000075 | -0.577 | -0.016 | -0.002 |
| -1.495000000000075 | -0.577 | -0.016 | -0.002 |
| -1.490000000000075 | -0.577 | -0.016 | -0.002 |
| -1.485000000000075 | -0.577 | -0.016 | -0.002 |
| -1.480000000000075 | -0.577 | -0.015 | -0.002 |
| -1.475000000000075 | -0.576 | -0.015 | -0.002 |
| -1.470000000000075 | -0.576 | -0.015 | -0.002 |
| -1.465000000000075 | -0.576 | -0.015 | -0.002 |
| -1.460000000000075 | -0.576 | -0.015 | -0.002 |
| -1.455000000000076 | -0.576 | -0.015 | -0.002 |
| -1.450000000000076 | -0.576 | -0.015 | -0.002 |
| -1.445000000000076 | -0.575 | -0.015 | -0.002 |
| -1.440000000000076 | -0.575 | -0.015 | -0.002 |
| -1.435000000000076 | -0.575 | -0.015 | -0.002 |
| -1.430000000000076 | -0.575 | -0.015 | -0.002 |
| -1.425000000000076 | -0.575 | -0.015 | -0.002 |
| -1.420000000000076 | -0.575 | -0.015 | -0.002 |
| -1.415000000000076 | -0.574 | -0.015 | -0.002 |
| -1.410000000000077 | -0.574 | -0.015 | -0.002 |
| -1.405000000000077 | -0.574 | -0.015 | -0.002 |
| -1.400000000000077 | -0.574 | -0.015 | -0.002 |
| -1.395000000000077 | -0.574 | -0.015 | -0.002 |
| -1.390000000000077 | -0.573 | -0.015 | -0.002 |
| -1.385000000000077 | -0.573 | -0.015 | -0.002 |
| -1.380000000000077 | -0.573 | -0.015 | -0.002 |
| -1.375000000000077 | -0.573 | -0.015 | -0.002 |
| -1.370000000000077 | -0.573 | -0.015 | -0.002 |
| -1.365000000000077 | -0.572 | -0.015 | -0.002 |
| -1.360000000000078 | -0.572 | -0.015 | -0.002 |
| -1.355000000000078 | -0.572 | -0.015 | -0.002 |
| -1.350000000000078 | -0.572 | -0.015 | -0.002 |
| -1.345000000000078 | -0.571 | -0.015 | -0.002 |
| -1.340000000000078 | -0.571 | -0.015 | -0.002 |
| -1.335000000000078 | -0.571 | -0.015 | -0.002 |
| -1.330000000000078 | -0.571 | -0.015 | -0.002 |
| -1.325000000000078 | -0.571 | -0.015 | -0.002 |
| -1.320000000000078 | -0.57 | -0.015 | -0.002 |
| -1.315000000000079 | -0.57 | -0.015 | -0.002 |
| -1.310000000000079 | -0.57 | -0.015 | -0.002 |
| -1.305000000000079 | -0.57 | -0.015 | -0.002 |
| -1.300000000000079 | -0.569 | -0.015 | -0.002 |
| -1.295000000000079 | -0.569 | -0.015 | -0.002 |
| -1.29000000000008 | -0.569 | -0.015 | -0.002 |
| -1.285000000000079 | -0.569 | -0.015 | -0.001 |
| -1.280000000000079 | -0.568 | -0.015 | -0.001 |
| -1.275000000000079 | -0.568 | -0.014 | -0.001 |
| -1.270000000000079 | -0.568 | -0.014 | -0.001 |
| -1.26500000000008 | -0.567 | -0.014 | -0.001 |
| -1.26000000000008 | -0.567 | -0.014 | -0.001 |
| -1.25500000000008 | -0.567 | -0.014 | -0.001 |
| -1.25000000000008 | -0.567 | -0.014 | -0.001 |
| -1.24500000000008 | -0.566 | -0.014 | -0.001 |
| -1.24000000000008 | -0.566 | -0.014 | -0.001 |
| -1.23500000000008 | -0.566 | -0.014 | -0.001 |
| -1.23000000000008 | -0.565 | -0.014 | -0.001 |
| -1.22500000000008 | -0.565 | -0.014 | -0.001 |
| -1.220000000000081 | -0.565 | -0.014 | -0.001 |
| -1.215000000000081 | -0.564 | -0.014 | -0.001 |
| -1.210000000000081 | -0.564 | -0.014 | -0.001 |
| -1.205000000000081 | -0.564 | -0.014 | -0.001 |
| -1.200000000000081 | -0.563 | -0.014 | -0.001 |
| -1.195000000000081 | -0.563 | -0.014 | -0.001 |
| -1.190000000000081 | -0.563 | -0.014 | -0.001 |
| -1.185000000000081 | -0.562 | -0.014 | -0.001 |
| -1.180000000000081 | -0.562 | -0.014 | -0.001 |
| -1.175000000000082 | -0.562 | -0.014 | -0.001 |
| -1.170000000000082 | -0.561 | -0.014 | -0.001 |
| -1.165000000000082 | -0.561 | -0.014 | -0.001 |
| -1.160000000000082 | -0.56 | -0.014 | -0.001 |
| -1.155000000000082 | -0.56 | -0.014 | -0.001 |
| -1.150000000000082 | -0.56 | -0.014 | -0.001 |
| -1.145000000000082 | -0.559 | -0.014 | -0.001 |
| -1.140000000000082 | -0.559 | -0.014 | -0.001 |
| -1.135000000000082 | -0.558 | -0.014 | -0.001 |
| -1.130000000000082 | -0.558 | -0.014 | -0.001 |
| -1.125000000000083 | -0.558 | -0.014 | -0.001 |
| -1.120000000000083 | -0.557 | -0.014 | -0.001 |
| -1.115000000000083 | -0.557 | -0.013 | -0.001 |
| -1.110000000000083 | -0.556 | -0.013 | -0.001 |
| -1.105000000000083 | -0.556 | -0.013 | -0.001 |
| -1.100000000000083 | -0.555 | -0.013 | -0.001 |
| -1.095000000000083 | -0.555 | -0.013 | -0.001 |
| -1.090000000000083 | -0.554 | -0.013 | -0.001 |
| -1.085000000000083 | -0.554 | -0.013 | -0.001 |
| -1.080000000000084 | -0.553 | -0.013 | -0.001 |
| -1.075000000000084 | -0.553 | -0.013 | -0.001 |
| -1.070000000000084 | -0.552 | -0.013 | -0.001 |
| -1.065000000000084 | -0.552 | -0.013 | -0.001 |
| -1.060000000000084 | -0.551 | -0.013 | -0.001 |
| -1.055000000000084 | -0.551 | -0.013 | -0.001 |
| -1.050000000000084 | -0.55 | -0.013 | -0.001 |
| -1.045000000000084 | -0.55 | -0.013 | -0.001 |
| -1.040000000000084 | -0.549 | -0.013 | -0.001 |
| -1.035000000000085 | -0.549 | -0.013 | -0.001 |
| -1.030000000000085 | -0.548 | -0.013 | -0.001 |
| -1.025000000000085 | -0.548 | -0.013 | -0.001 |
| -1.020000000000085 | -0.547 | -0.013 | -0.001 |
| -1.015000000000085 | -0.546 | -0.013 | -0.001 |
| -1.010000000000085 | -0.546 | -0.013 | -0.001 |
| -1.005000000000085 | -0.545 | -0.013 | -0.001 |
| -1.000000000000085 | -0.545 | -0.013 | -0.001 |
| -0.995000000000085 | -0.544 | -0.013 | -0.001 |
| -0.990000000000085 | -0.543 | -0.013 | -0.001 |
| -0.985000000000085 | -0.543 | -0.012 | -0.001 |
| -0.980000000000085 | -0.542 | -0.012 | -0.001 |
| -0.975000000000085 | -0.541 | -0.012 | -0.001 |
| -0.970000000000085 | -0.541 | -0.012 | -0.001 |
| -0.965000000000085 | -0.54 | -0.012 | -0.001 |
| -0.960000000000085 | -0.539 | -0.012 | -0.001 |
| -0.955000000000085 | -0.539 | -0.012 | -0.001 |
| -0.950000000000085 | -0.538 | -0.012 | -0.001 |
| -0.945000000000085 | -0.537 | -0.012 | -0.001 |
| -0.940000000000085 | -0.536 | -0.012 | -0.001 |
| -0.935000000000085 | -0.536 | -0.012 | -0.001 |
| -0.930000000000085 | -0.535 | -0.012 | -0.001 |
| -0.925000000000085 | -0.534 | -0.012 | -0.001 |
| -0.920000000000085 | -0.533 | -0.012 | -0.001 |
| -0.915000000000085 | -0.532 | -0.012 | -0.001 |
| -0.910000000000085 | -0.532 | -0.012 | -0.001 |
| -0.905000000000085 | -0.531 | -0.012 | -0.001 |
| -0.900000000000085 | -0.53 | -0.012 | -0.001 |
| -0.895000000000085 | -0.529 | -0.012 | -0.001 |
| -0.890000000000085 | -0.528 | -0.012 | -0.001 |
| -0.885000000000085 | -0.527 | -0.012 | -0.001 |
| -0.880000000000085 | -0.526 | -0.012 | -0.001 |
| -0.875000000000085 | -0.526 | -0.012 | -0.001 |
| -0.870000000000085 | -0.525 | -0.011 | -0.001 |
| -0.865000000000085 | -0.524 | -0.011 | -0.001 |
| -0.860000000000085 | -0.523 | -0.011 | -0.001 |
| -0.855000000000085 | -0.522 | -0.011 | -0.001 |
| -0.850000000000085 | -0.521 | -0.011 | -0.001 |
| -0.845000000000085 | -0.52 | -0.011 | -0.001 |
| -0.840000000000085 | -0.519 | -0.011 | -0.001 |
| -0.835000000000085 | -0.518 | -0.011 | -0.001 |
| -0.830000000000085 | -0.517 | -0.011 | -0.001 |
| -0.825000000000085 | -0.516 | -0.011 | -0.001 |
| -0.820000000000085 | -0.515 | -0.011 | -0.001 |
| -0.815000000000085 | -0.514 | -0.011 | -0.001 |
| -0.810000000000085 | -0.513 | -0.011 | -0.001 |
| -0.805000000000085 | -0.511 | -0.011 | -0.001 |
| -0.800000000000085 | -0.51 | -0.011 | -0.001 |
| -0.795000000000085 | -0.509 | -0.011 | -0.001 |
| -0.790000000000085 | -0.508 | -0.011 | -0.001 |
| -0.785000000000085 | -0.507 | -0.011 | -0.001 |
| -0.780000000000085 | -0.506 | -0.011 | -0.001 |
| -0.775000000000085 | -0.504 | -0.011 | -0.001 |
| -0.770000000000085 | -0.503 | -0.011 | -0.001 |
| -0.765000000000085 | -0.502 | -0.01 | -0.001 |
| -0.760000000000085 | -0.501 | -0.01 | -0.001 |
| -0.755000000000085 | -0.499 | -0.01 | -0.001 |
| -0.750000000000085 | -0.498 | -0.01 | -0.001 |
| -0.745000000000085 | -0.497 | -0.01 | -0.001 |
| -0.740000000000085 | -0.495 | -0.01 | -0.001 |
| -0.735000000000085 | -0.494 | -0.01 | -0.001 |
| -0.730000000000085 | -0.493 | -0.01 | -0.001 |
| -0.725000000000085 | -0.491 | -0.01 | -0.001 |
| -0.720000000000085 | -0.49 | -0.01 | -0.001 |
| -0.715000000000085 | -0.488 | -0.01 | -0.001 |
| -0.710000000000085 | -0.487 | -0.01 | -0.001 |
| -0.705000000000085 | -0.486 | -0.01 | -0.001 |
| -0.700000000000085 | -0.484 | -0.01 | -0.001 |
| -0.695000000000085 | -0.482 | -0.01 | -0.001 |
| -0.690000000000085 | -0.481 | -0.01 | -0.001 |
| -0.685000000000085 | -0.479 | -0.01 | -0.001 |
| -0.680000000000085 | -0.478 | -0.01 | -0.001 |
| -0.675000000000085 | -0.476 | -0.009 | -0.001 |
| -0.670000000000085 | -0.475 | -0.009 | -0.001 |
| -0.665000000000085 | -0.473 | -0.009 | -0.001 |
| -0.660000000000085 | -0.471 | -0.009 | -0.001 |
| -0.655000000000085 | -0.47 | -0.009 | -0.001 |
| -0.650000000000085 | -0.468 | -0.009 | -0.001 |
| -0.645000000000085 | -0.466 | -0.009 | -0.001 |
| -0.640000000000085 | -0.464 | -0.009 | -0.001 |
| -0.635000000000085 | -0.462 | -0.009 | -0.001 |
| -0.630000000000085 | -0.461 | -0.009 | -0.001 |
| -0.625000000000085 | -0.459 | -0.009 | -0.001 |
| -0.620000000000085 | -0.457 | -0.009 | -0.001 |
| -0.615000000000085 | -0.455 | -0.009 | -0.001 |
| -0.610000000000085 | -0.453 | -0.009 | -0.001 |
| -0.605000000000085 | -0.451 | -0.009 | -0.001 |
| -0.600000000000085 | -0.449 | -0.009 | -0.001 |
| -0.595000000000085 | -0.447 | -0.009 | -0.001 |
| -0.590000000000085 | -0.445 | -0.008 | -0.001 |
| -0.585000000000085 | -0.443 | -0.008 | -0.001 |
| -0.580000000000085 | -0.441 | -0.008 | -0.001 |
| -0.575000000000085 | -0.439 | -0.008 | -0.001 |
| -0.570000000000085 | -0.437 | -0.008 | -0.001 |
| -0.565000000000085 | -0.435 | -0.008 | -0.001 |
| -0.560000000000085 | -0.432 | -0.008 | -0.001 |
| -0.555000000000085 | -0.43 | -0.008 | -0.001 |
| -0.550000000000085 | -0.428 | -0.008 | -0.001 |
| -0.545000000000085 | -0.426 | -0.008 | -0.001 |
| -0.540000000000085 | -0.423 | -0.008 | -0.001 |
| -0.535000000000085 | -0.421 | -0.008 | -0.001 |
| -0.530000000000085 | -0.419 | -0.008 | -0.001 |
| -0.525000000000085 | -0.416 | -0.008 | -0.001 |
| -0.520000000000085 | -0.414 | -0.008 | -0.001 |
| -0.515000000000085 | -0.411 | -0.008 | -0.001 |
| -0.510000000000085 | -0.409 | -0.007 | -0.001 |
| -0.505000000000085 | -0.406 | -0.007 | -0.001 |
| -0.500000000000085 | -0.404 | -0.007 | -0.001 |
| -0.495000000000085 | -0.401 | -0.007 | -0.001 |
| -0.490000000000085 | -0.399 | -0.007 | -0.001 |
| -0.485000000000085 | -0.396 | -0.007 | -0.001 |
| -0.480000000000085 | -0.393 | -0.007 | -0.001 |
| -0.475000000000085 | -0.391 | -0.007 | -0.001 |
| -0.470000000000085 | -0.388 | -0.007 | -0.001 |
| -0.465000000000085 | -0.385 | -0.007 | -0.001 |
| -0.460000000000085 | -0.382 | -0.007 | -0.001 |
| -0.455000000000085 | -0.38 | -0.007 | -0.001 |
| -0.450000000000085 | -0.377 | -0.007 | -0.001 |
| -0.445000000000085 | -0.374 | -0.007 | -0.001 |
| -0.440000000000085 | -0.371 | -0.007 | -0.001 |
| -0.435000000000085 | -0.368 | -0.006 | -0.001 |
| -0.430000000000085 | -0.365 | -0.006 | -0.001 |
| -0.425000000000085 | -0.362 | -0.006 | -0.001 |
| -0.420000000000085 | -0.359 | -0.006 | -0.001 |
| -0.415000000000085 | -0.356 | -0.006 | -0.001 |
| -0.410000000000085 | -0.353 | -0.006 | -0.001 |
| -0.405000000000085 | -0.35 | -0.006 | -0.001 |
| -0.400000000000085 | -0.346 | -0.006 | -0.001 |
| -0.395000000000085 | -0.343 | -0.006 | -0.001 |
| -0.390000000000085 | -0.34 | -0.006 | -0.001 |
| -0.385000000000085 | -0.337 | -0.006 | -0.001 |
| -0.380000000000085 | -0.333 | -0.006 | -0.001 |
| -0.375000000000085 | -0.33 | -0.006 | -0.001 |
| -0.370000000000085 | -0.326 | -0.006 | 0 |
| -0.365000000000085 | -0.323 | -0.006 | 0 |
| -0.360000000000085 | -0.32 | -0.005 | 0 |
| -0.355000000000085 | -0.316 | -0.005 | 0 |
| -0.350000000000085 | -0.313 | -0.005 | 0 |
| -0.345000000000085 | -0.309 | -0.005 | 0 |
| -0.340000000000085 | -0.305 | -0.005 | 0 |
| -0.335000000000085 | -0.302 | -0.005 | 0 |
| -0.330000000000085 | -0.298 | -0.005 | 0 |
| -0.325000000000085 | -0.295 | -0.005 | 0 |
| -0.320000000000085 | -0.291 | -0.005 | 0 |
| -0.315000000000085 | -0.287 | -0.005 | 0 |
| -0.310000000000085 | -0.283 | -0.005 | 0 |
| -0.305000000000085 | -0.279 | -0.005 | 0 |
| -0.300000000000085 | -0.276 | -0.005 | 0 |
| -0.295000000000085 | -0.272 | -0.005 | 0 |
| -0.290000000000085 | -0.268 | -0.004 | 0 |
| -0.285000000000085 | -0.264 | -0.004 | 0 |
| -0.280000000000085 | -0.26 | -0.004 | 0 |
| -0.275000000000085 | -0.256 | -0.004 | 0 |
| -0.270000000000085 | -0.252 | -0.004 | 0 |
| -0.265000000000085 | -0.248 | -0.004 | 0 |
| -0.260000000000085 | -0.244 | -0.004 | 0 |
| -0.255000000000085 | -0.24 | -0.004 | 0 |
| -0.250000000000085 | -0.235 | -0.004 | 0 |
| -0.245000000000085 | -0.231 | -0.004 | 0 |
| -0.240000000000085 | -0.227 | -0.004 | 0 |
| -0.235000000000085 | -0.223 | -0.004 | 0 |
| -0.230000000000085 | -0.219 | -0.004 | 0 |
| -0.225000000000085 | -0.214 | -0.003 | 0 |
| -0.220000000000085 | -0.21 | -0.003 | 0 |
| -0.215000000000085 | -0.206 | -0.003 | 0 |
| -0.210000000000085 | -0.201 | -0.003 | 0 |
| -0.205000000000085 | -0.197 | -0.003 | 0 |
| -0.200000000000085 | -0.192 | -0.003 | 0 |
| -0.195000000000085 | -0.188 | -0.003 | 0 |
| -0.190000000000085 | -0.183 | -0.003 | 0 |
| -0.185000000000085 | -0.179 | -0.003 | 0 |
| -0.180000000000085 | -0.174 | -0.003 | 0 |
| -0.175000000000085 | -0.17 | -0.003 | 0 |
| -0.170000000000085 | -0.165 | -0.003 | 0 |
| -0.165000000000085 | -0.161 | -0.003 | 0 |
| -0.160000000000085 | -0.156 | -0.002 | 0 |
| -0.155000000000084 | -0.151 | -0.002 | 0 |
| -0.150000000000084 | -0.147 | -0.002 | 0 |
| -0.145000000000084 | -0.142 | -0.002 | 0 |
| -0.140000000000084 | -0.137 | -0.002 | 0 |
| -0.135000000000084 | -0.133 | -0.002 | 0 |
| -0.130000000000084 | -0.128 | -0.002 | 0 |
| -0.125000000000084 | -0.123 | -0.002 | 0 |
| -0.120000000000084 | -0.118 | -0.002 | 0 |
| -0.115000000000084 | -0.114 | -0.002 | 0 |
| -0.110000000000084 | -0.109 | -0.002 | 0 |
| -0.105000000000084 | -0.104 | -0.002 | 0 |
| -0.100000000000084 | -0.099 | -0.002 | 0 |
| -0.0950000000000844 | -0.094 | -0.001 | 0 |
| -0.0900000000000844 | -0.089 | -0.001 | 0 |
| -0.0850000000000844 | -0.084 | -0.001 | 0 |
| -0.0800000000000844 | -0.079 | -0.001 | 0 |
| -0.0750000000000844 | -0.075 | -0.001 | 0 |
| -0.0700000000000844 | -0.07 | -0.001 | 0 |
| -0.0650000000000844 | -0.065 | -0.001 | 0 |
| -0.0600000000000844 | -0.06 | -0.001 | 0 |
| -0.0550000000000844 | -0.055 | -0.001 | 0 |
| -0.0500000000000844 | -0.05 | -0.001 | 0 |
| -0.0450000000000844 | -0.045 | -0.001 | 0 |
| -0.0400000000000844 | -0.04 | -0.001 | 0 |
| -0.0350000000000844 | -0.035 | -0.001 | 0 |
| -0.0300000000000844 | -0.03 | 0 | 0 |
| -0.0250000000000844 | -0.025 | 0 | 0 |
| -0.0200000000000844 | -0.02 | 0 | 0 |
| -0.0150000000000844 | -0.015 | 0 | 0 |
| -0.0100000000000844 | -0.01 | 0 | 0 |
| -0.00500000000008444 | -0.005 | 0 | 0 |
| -8.4444604087075e-14 | 0 | 0 | 0 |
| 0.00499999999991555 | 0.005 | 0 | 0 |
| 0.00999999999991555 | 0.01 | 0 | 0 |
| 0.0149999999999156 | 0.015 | 0 | 0 |
| 0.0199999999999156 | 0.02 | 0 | 0 |
| 0.0249999999999156 | 0.025 | 0 | 0 |
| 0.0299999999999156 | 0.03 | 0 | 0 |
| 0.0349999999999155 | 0.035 | 0.001 | 0 |
| 0.0399999999999155 | 0.04 | 0.001 | 0 |
| 0.0449999999999155 | 0.045 | 0.001 | 0 |
| 0.0499999999999155 | 0.05 | 0.001 | 0 |
| 0.0549999999999155 | 0.055 | 0.001 | 0 |
| 0.0599999999999155 | 0.06 | 0.001 | 0 |
| 0.0649999999999155 | 0.065 | 0.001 | 0 |
| 0.0699999999999155 | 0.07 | 0.001 | 0 |
| 0.0749999999999155 | 0.075 | 0.001 | 0 |
| 0.0799999999999155 | 0.079 | 0.001 | 0 |
| 0.0849999999999155 | 0.084 | 0.001 | 0 |
| 0.0899999999999155 | 0.089 | 0.001 | 0 |
| 0.0949999999999155 | 0.094 | 0.001 | 0 |
| 0.0999999999999155 | 0.099 | 0.002 | 0 |
| 0.104999999999916 | 0.104 | 0.002 | 0 |
| 0.109999999999916 | 0.109 | 0.002 | 0 |
| 0.114999999999916 | 0.114 | 0.002 | 0 |
| 0.119999999999916 | 0.118 | 0.002 | 0 |
| 0.124999999999916 | 0.123 | 0.002 | 0 |
| 0.129999999999916 | 0.128 | 0.002 | 0 |
| 0.134999999999916 | 0.133 | 0.002 | 0 |
| 0.139999999999916 | 0.137 | 0.002 | 0 |
| 0.144999999999916 | 0.142 | 0.002 | 0 |
| 0.149999999999916 | 0.147 | 0.002 | 0 |
| 0.154999999999916 | 0.151 | 0.002 | 0 |
| 0.159999999999916 | 0.156 | 0.002 | 0 |
| 0.164999999999916 | 0.161 | 0.003 | 0 |
| 0.169999999999916 | 0.165 | 0.003 | 0 |
| 0.174999999999916 | 0.17 | 0.003 | 0 |
| 0.179999999999916 | 0.174 | 0.003 | 0 |
| 0.184999999999916 | 0.179 | 0.003 | 0 |
| 0.189999999999916 | 0.183 | 0.003 | 0 |
| 0.194999999999916 | 0.188 | 0.003 | 0 |
| 0.199999999999916 | 0.192 | 0.003 | 0 |
| 0.204999999999916 | 0.197 | 0.003 | 0 |
| 0.209999999999916 | 0.201 | 0.003 | 0 |
| 0.214999999999916 | 0.206 | 0.003 | 0 |
| 0.219999999999916 | 0.21 | 0.003 | 0 |
| 0.224999999999916 | 0.214 | 0.003 | 0 |
| 0.229999999999916 | 0.219 | 0.004 | 0 |
| 0.234999999999916 | 0.223 | 0.004 | 0 |
| 0.239999999999916 | 0.227 | 0.004 | 0 |
| 0.244999999999916 | 0.231 | 0.004 | 0 |
| 0.249999999999916 | 0.235 | 0.004 | 0 |
| 0.254999999999916 | 0.24 | 0.004 | 0 |
| 0.259999999999916 | 0.244 | 0.004 | 0 |
| 0.264999999999916 | 0.248 | 0.004 | 0 |
| 0.269999999999916 | 0.252 | 0.004 | 0 |
| 0.274999999999916 | 0.256 | 0.004 | 0 |
| 0.279999999999916 | 0.26 | 0.004 | 0 |
| 0.284999999999916 | 0.264 | 0.004 | 0 |
| 0.289999999999916 | 0.268 | 0.004 | 0 |
| 0.294999999999916 | 0.272 | 0.005 | 0 |
| 0.299999999999916 | 0.276 | 0.005 | 0 |
| 0.304999999999916 | 0.279 | 0.005 | 0 |
| 0.309999999999916 | 0.283 | 0.005 | 0 |
| 0.314999999999916 | 0.287 | 0.005 | 0 |
| 0.319999999999916 | 0.291 | 0.005 | 0 |
| 0.324999999999916 | 0.295 | 0.005 | 0 |
| 0.329999999999916 | 0.298 | 0.005 | 0 |
| 0.334999999999916 | 0.302 | 0.005 | 0 |
| 0.339999999999916 | 0.305 | 0.005 | 0 |
| 0.344999999999916 | 0.309 | 0.005 | 0 |
| 0.349999999999916 | 0.313 | 0.005 | 0 |
| 0.354999999999916 | 0.316 | 0.005 | 0 |
| 0.359999999999916 | 0.32 | 0.005 | 0 |
| 0.364999999999916 | 0.323 | 0.006 | 0 |
| 0.369999999999916 | 0.326 | 0.006 | 0 |
| 0.374999999999916 | 0.33 | 0.006 | 0.001 |
| 0.379999999999916 | 0.333 | 0.006 | 0.001 |
| 0.384999999999916 | 0.337 | 0.006 | 0.001 |
| 0.389999999999916 | 0.34 | 0.006 | 0.001 |
| 0.394999999999916 | 0.343 | 0.006 | 0.001 |
| 0.399999999999916 | 0.346 | 0.006 | 0.001 |
| 0.404999999999916 | 0.35 | 0.006 | 0.001 |
| 0.409999999999916 | 0.353 | 0.006 | 0.001 |
| 0.414999999999916 | 0.356 | 0.006 | 0.001 |
| 0.419999999999916 | 0.359 | 0.006 | 0.001 |
| 0.424999999999916 | 0.362 | 0.006 | 0.001 |
| 0.429999999999916 | 0.365 | 0.006 | 0.001 |
| 0.434999999999916 | 0.368 | 0.006 | 0.001 |
| 0.439999999999916 | 0.371 | 0.007 | 0.001 |
| 0.444999999999916 | 0.374 | 0.007 | 0.001 |
| 0.449999999999916 | 0.377 | 0.007 | 0.001 |
| 0.454999999999916 | 0.38 | 0.007 | 0.001 |
| 0.459999999999916 | 0.382 | 0.007 | 0.001 |
| 0.464999999999916 | 0.385 | 0.007 | 0.001 |
| 0.469999999999916 | 0.388 | 0.007 | 0.001 |
| 0.474999999999916 | 0.391 | 0.007 | 0.001 |
| 0.479999999999916 | 0.393 | 0.007 | 0.001 |
| 0.484999999999916 | 0.396 | 0.007 | 0.001 |
| 0.489999999999916 | 0.399 | 0.007 | 0.001 |
| 0.494999999999916 | 0.401 | 0.007 | 0.001 |
| 0.499999999999916 | 0.404 | 0.007 | 0.001 |
| 0.504999999999916 | 0.406 | 0.007 | 0.001 |
| 0.509999999999916 | 0.409 | 0.007 | 0.001 |
| 0.514999999999916 | 0.411 | 0.008 | 0.001 |
| 0.519999999999916 | 0.414 | 0.008 | 0.001 |
| 0.524999999999916 | 0.416 | 0.008 | 0.001 |
| 0.529999999999916 | 0.419 | 0.008 | 0.001 |
| 0.534999999999916 | 0.421 | 0.008 | 0.001 |
| 0.539999999999916 | 0.423 | 0.008 | 0.001 |
| 0.544999999999916 | 0.426 | 0.008 | 0.001 |
| 0.549999999999916 | 0.428 | 0.008 | 0.001 |
| 0.554999999999916 | 0.43 | 0.008 | 0.001 |
| 0.559999999999916 | 0.432 | 0.008 | 0.001 |
| 0.564999999999916 | 0.435 | 0.008 | 0.001 |
| 0.569999999999916 | 0.437 | 0.008 | 0.001 |
| 0.574999999999916 | 0.439 | 0.008 | 0.001 |
| 0.579999999999916 | 0.441 | 0.008 | 0.001 |
| 0.584999999999916 | 0.443 | 0.008 | 0.001 |
| 0.589999999999916 | 0.445 | 0.008 | 0.001 |
| 0.594999999999916 | 0.447 | 0.009 | 0.001 |
| 0.599999999999916 | 0.449 | 0.009 | 0.001 |
| 0.604999999999916 | 0.451 | 0.009 | 0.001 |
| 0.609999999999916 | 0.453 | 0.009 | 0.001 |
| 0.614999999999916 | 0.455 | 0.009 | 0.001 |
| 0.619999999999916 | 0.457 | 0.009 | 0.001 |
| 0.624999999999916 | 0.459 | 0.009 | 0.001 |
| 0.629999999999916 | 0.461 | 0.009 | 0.001 |
| 0.634999999999916 | 0.462 | 0.009 | 0.001 |
| 0.639999999999916 | 0.464 | 0.009 | 0.001 |
| 0.644999999999916 | 0.466 | 0.009 | 0.001 |
| 0.649999999999916 | 0.468 | 0.009 | 0.001 |
| 0.654999999999916 | 0.47 | 0.009 | 0.001 |
| 0.659999999999916 | 0.471 | 0.009 | 0.001 |
| 0.664999999999916 | 0.473 | 0.009 | 0.001 |
| 0.669999999999916 | 0.475 | 0.009 | 0.001 |
| 0.674999999999916 | 0.476 | 0.009 | 0.001 |
| 0.679999999999916 | 0.478 | 0.01 | 0.001 |
| 0.684999999999916 | 0.479 | 0.01 | 0.001 |
| 0.689999999999916 | 0.481 | 0.01 | 0.001 |
| 0.694999999999916 | 0.482 | 0.01 | 0.001 |
| 0.699999999999916 | 0.484 | 0.01 | 0.001 |
| 0.704999999999916 | 0.486 | 0.01 | 0.001 |
| 0.709999999999916 | 0.487 | 0.01 | 0.001 |
| 0.714999999999916 | 0.488 | 0.01 | 0.001 |
| 0.719999999999916 | 0.49 | 0.01 | 0.001 |
| 0.724999999999916 | 0.491 | 0.01 | 0.001 |
| 0.729999999999916 | 0.493 | 0.01 | 0.001 |
| 0.734999999999916 | 0.494 | 0.01 | 0.001 |
| 0.739999999999916 | 0.495 | 0.01 | 0.001 |
| 0.744999999999916 | 0.497 | 0.01 | 0.001 |
| 0.749999999999916 | 0.498 | 0.01 | 0.001 |
| 0.754999999999916 | 0.499 | 0.01 | 0.001 |
| 0.759999999999916 | 0.501 | 0.01 | 0.001 |
| 0.764999999999916 | 0.502 | 0.01 | 0.001 |
| 0.769999999999916 | 0.503 | 0.011 | 0.001 |
| 0.774999999999916 | 0.504 | 0.011 | 0.001 |
| 0.779999999999916 | 0.506 | 0.011 | 0.001 |
| 0.784999999999916 | 0.507 | 0.011 | 0.001 |
| 0.789999999999916 | 0.508 | 0.011 | 0.001 |
| 0.794999999999916 | 0.509 | 0.011 | 0.001 |
| 0.799999999999916 | 0.51 | 0.011 | 0.001 |
| 0.804999999999916 | 0.511 | 0.011 | 0.001 |
| 0.809999999999916 | 0.513 | 0.011 | 0.001 |
| 0.814999999999916 | 0.514 | 0.011 | 0.001 |
| 0.819999999999916 | 0.515 | 0.011 | 0.001 |
| 0.824999999999916 | 0.516 | 0.011 | 0.001 |
| 0.829999999999916 | 0.517 | 0.011 | 0.001 |
| 0.834999999999916 | 0.518 | 0.011 | 0.001 |
| 0.839999999999916 | 0.519 | 0.011 | 0.001 |
| 0.844999999999916 | 0.52 | 0.011 | 0.001 |
| 0.849999999999916 | 0.521 | 0.011 | 0.001 |
| 0.854999999999916 | 0.522 | 0.011 | 0.001 |
| 0.859999999999916 | 0.523 | 0.011 | 0.001 |
| 0.864999999999916 | 0.524 | 0.011 | 0.001 |
| 0.869999999999916 | 0.525 | 0.011 | 0.001 |
| 0.874999999999916 | 0.526 | 0.012 | 0.001 |
| 0.879999999999916 | 0.526 | 0.012 | 0.001 |
| 0.884999999999916 | 0.527 | 0.012 | 0.001 |
| 0.889999999999916 | 0.528 | 0.012 | 0.001 |
| 0.894999999999916 | 0.529 | 0.012 | 0.001 |
| 0.899999999999916 | 0.53 | 0.012 | 0.001 |
| 0.904999999999916 | 0.531 | 0.012 | 0.001 |
| 0.909999999999916 | 0.532 | 0.012 | 0.001 |
| 0.914999999999916 | 0.532 | 0.012 | 0.001 |
| 0.919999999999916 | 0.533 | 0.012 | 0.001 |
| 0.924999999999916 | 0.534 | 0.012 | 0.001 |
| 0.929999999999916 | 0.535 | 0.012 | 0.001 |
| 0.934999999999916 | 0.536 | 0.012 | 0.001 |
| 0.939999999999916 | 0.536 | 0.012 | 0.001 |
| 0.944999999999916 | 0.537 | 0.012 | 0.001 |
| 0.949999999999916 | 0.538 | 0.012 | 0.001 |
| 0.954999999999916 | 0.539 | 0.012 | 0.001 |
| 0.959999999999916 | 0.539 | 0.012 | 0.001 |
| 0.964999999999916 | 0.54 | 0.012 | 0.001 |
| 0.969999999999916 | 0.541 | 0.012 | 0.001 |
| 0.974999999999916 | 0.541 | 0.012 | 0.001 |
| 0.979999999999916 | 0.542 | 0.012 | 0.001 |
| 0.984999999999916 | 0.543 | 0.012 | 0.001 |
| 0.989999999999916 | 0.543 | 0.013 | 0.001 |
| 0.994999999999916 | 0.544 | 0.013 | 0.001 |
| 0.999999999999916 | 0.545 | 0.013 | 0.001 |
| 1.004999999999916 | 0.545 | 0.013 | 0.001 |
| 1.009999999999916 | 0.546 | 0.013 | 0.001 |
| 1.014999999999916 | 0.546 | 0.013 | 0.001 |
| 1.019999999999916 | 0.547 | 0.013 | 0.001 |
| 1.024999999999916 | 0.548 | 0.013 | 0.001 |
| 1.029999999999916 | 0.548 | 0.013 | 0.001 |
| 1.034999999999916 | 0.549 | 0.013 | 0.001 |
| 1.039999999999915 | 0.549 | 0.013 | 0.001 |
| 1.044999999999915 | 0.55 | 0.013 | 0.001 |
| 1.049999999999915 | 0.55 | 0.013 | 0.001 |
| 1.054999999999915 | 0.551 | 0.013 | 0.001 |
| 1.059999999999915 | 0.551 | 0.013 | 0.001 |
| 1.064999999999915 | 0.552 | 0.013 | 0.001 |
| 1.069999999999915 | 0.552 | 0.013 | 0.001 |
| 1.074999999999915 | 0.553 | 0.013 | 0.001 |
| 1.079999999999915 | 0.553 | 0.013 | 0.001 |
| 1.084999999999914 | 0.554 | 0.013 | 0.001 |
| 1.089999999999914 | 0.554 | 0.013 | 0.001 |
| 1.094999999999914 | 0.555 | 0.013 | 0.001 |
| 1.099999999999914 | 0.555 | 0.013 | 0.001 |
| 1.104999999999914 | 0.556 | 0.013 | 0.001 |
| 1.109999999999914 | 0.556 | 0.013 | 0.001 |
| 1.114999999999914 | 0.557 | 0.013 | 0.001 |
| 1.119999999999914 | 0.557 | 0.014 | 0.001 |
| 1.124999999999914 | 0.558 | 0.014 | 0.001 |
| 1.129999999999914 | 0.558 | 0.014 | 0.001 |
| 1.134999999999913 | 0.558 | 0.014 | 0.001 |
| 1.139999999999913 | 0.559 | 0.014 | 0.001 |
| 1.144999999999913 | 0.559 | 0.014 | 0.001 |
| 1.149999999999913 | 0.56 | 0.014 | 0.001 |
| 1.154999999999913 | 0.56 | 0.014 | 0.001 |
| 1.159999999999913 | 0.56 | 0.014 | 0.001 |
| 1.164999999999913 | 0.561 | 0.014 | 0.001 |
| 1.169999999999913 | 0.561 | 0.014 | 0.001 |
| 1.174999999999913 | 0.562 | 0.014 | 0.001 |
| 1.179999999999912 | 0.562 | 0.014 | 0.001 |
| 1.184999999999912 | 0.562 | 0.014 | 0.001 |
| 1.189999999999912 | 0.563 | 0.014 | 0.001 |
| 1.194999999999912 | 0.563 | 0.014 | 0.001 |
| 1.199999999999912 | 0.563 | 0.014 | 0.001 |
| 1.204999999999912 | 0.564 | 0.014 | 0.001 |
| 1.209999999999912 | 0.564 | 0.014 | 0.001 |
| 1.214999999999912 | 0.564 | 0.014 | 0.001 |
| 1.219999999999912 | 0.565 | 0.014 | 0.001 |
| 1.224999999999911 | 0.565 | 0.014 | 0.001 |
| 1.229999999999911 | 0.565 | 0.014 | 0.001 |
| 1.234999999999911 | 0.566 | 0.014 | 0.001 |
| 1.239999999999911 | 0.566 | 0.014 | 0.001 |
| 1.244999999999911 | 0.566 | 0.014 | 0.001 |
| 1.249999999999911 | 0.567 | 0.014 | 0.001 |
| 1.254999999999911 | 0.567 | 0.014 | 0.001 |
| 1.259999999999911 | 0.567 | 0.014 | 0.001 |
| 1.264999999999911 | 0.567 | 0.014 | 0.001 |
| 1.269999999999911 | 0.568 | 0.014 | 0.001 |
| 1.27499999999991 | 0.568 | 0.014 | 0.001 |
| 1.27999999999991 | 0.568 | 0.015 | 0.001 |
| 1.28499999999991 | 0.569 | 0.015 | 0.001 |
| 1.28999999999991 | 0.569 | 0.015 | 0.002 |
| 1.29499999999991 | 0.569 | 0.015 | 0.002 |
| 1.29999999999991 | 0.569 | 0.015 | 0.002 |
| 1.30499999999991 | 0.57 | 0.015 | 0.002 |
| 1.30999999999991 | 0.57 | 0.015 | 0.002 |
| 1.31499999999991 | 0.57 | 0.015 | 0.002 |
| 1.319999999999909 | 0.57 | 0.015 | 0.002 |
| 1.324999999999909 | 0.571 | 0.015 | 0.002 |
| 1.329999999999909 | 0.571 | 0.015 | 0.002 |
| 1.334999999999909 | 0.571 | 0.015 | 0.002 |
| 1.339999999999909 | 0.571 | 0.015 | 0.002 |
| 1.344999999999909 | 0.571 | 0.015 | 0.002 |
| 1.349999999999909 | 0.572 | 0.015 | 0.002 |
| 1.354999999999909 | 0.572 | 0.015 | 0.002 |
| 1.359999999999909 | 0.572 | 0.015 | 0.002 |
| 1.364999999999908 | 0.572 | 0.015 | 0.002 |
| 1.369999999999908 | 0.573 | 0.015 | 0.002 |
| 1.374999999999908 | 0.573 | 0.015 | 0.002 |
| 1.379999999999908 | 0.573 | 0.015 | 0.002 |
| 1.384999999999908 | 0.573 | 0.015 | 0.002 |
| 1.389999999999908 | 0.573 | 0.015 | 0.002 |
| 1.394999999999908 | 0.574 | 0.015 | 0.002 |
| 1.399999999999908 | 0.574 | 0.015 | 0.002 |
| 1.404999999999908 | 0.574 | 0.015 | 0.002 |
| 1.409999999999908 | 0.574 | 0.015 | 0.002 |
| 1.414999999999907 | 0.574 | 0.015 | 0.002 |
| 1.419999999999907 | 0.575 | 0.015 | 0.002 |
| 1.424999999999907 | 0.575 | 0.015 | 0.002 |
| 1.429999999999907 | 0.575 | 0.015 | 0.002 |
| 1.434999999999907 | 0.575 | 0.015 | 0.002 |
| 1.439999999999907 | 0.575 | 0.015 | 0.002 |
| 1.444999999999907 | 0.575 | 0.015 | 0.002 |
| 1.449999999999907 | 0.576 | 0.015 | 0.002 |
| 1.454999999999907 | 0.576 | 0.015 | 0.002 |
| 1.459999999999906 | 0.576 | 0.015 | 0.002 |
| 1.464999999999906 | 0.576 | 0.015 | 0.002 |
| 1.469999999999906 | 0.576 | 0.015 | 0.002 |
| 1.474999999999906 | 0.576 | 0.015 | 0.002 |
| 1.479999999999906 | 0.577 | 0.015 | 0.002 |
| 1.484999999999906 | 0.577 | 0.016 | 0.002 |
| 1.489999999999906 | 0.577 | 0.016 | 0.002 |
| 1.494999999999906 | 0.577 | 0.016 | 0.002 |
| 1.499999999999906 | 0.577 | 0.016 | 0.002 |
| 1.504999999999906 | 0.577 | 0.016 | 0.002 |
| 1.509999999999905 | 0.577 | 0.016 | 0.002 |
| 1.514999999999905 | 0.578 | 0.016 | 0.002 |
| 1.519999999999905 | 0.578 | 0.016 | 0.002 |
| 1.524999999999905 | 0.578 | 0.016 | 0.002 |
| 1.529999999999905 | 0.578 | 0.016 | 0.002 |
| 1.534999999999905 | 0.578 | 0.016 | 0.002 |
| 1.539999999999905 | 0.578 | 0.016 | 0.002 |
| 1.544999999999905 | 0.578 | 0.016 | 0.002 |
| 1.549999999999905 | 0.578 | 0.016 | 0.002 |
| 1.554999999999904 | 0.579 | 0.016 | 0.002 |
| 1.559999999999904 | 0.579 | 0.016 | 0.002 |
| 1.564999999999904 | 0.579 | 0.016 | 0.002 |
| 1.569999999999904 | 0.579 | 0.016 | 0.002 |
| 1.574999999999904 | 0.579 | 0.016 | 0.002 |
| 1.579999999999904 | 0.579 | 0.016 | 0.002 |
| 1.584999999999904 | 0.579 | 0.016 | 0.002 |
| 1.589999999999904 | 0.579 | 0.016 | 0.002 |
| 1.594999999999904 | 0.58 | 0.016 | 0.002 |
| 1.599999999999903 | 0.58 | 0.016 | 0.002 |
| 1.604999999999903 | 0.58 | 0.016 | 0.002 |
| 1.609999999999903 | 0.58 | 0.016 | 0.002 |
| 1.614999999999903 | 0.58 | 0.016 | 0.002 |
| 1.619999999999903 | 0.58 | 0.016 | 0.002 |
| 1.624999999999903 | 0.58 | 0.016 | 0.002 |
| 1.629999999999903 | 0.58 | 0.016 | 0.002 |
| 1.634999999999903 | 0.58 | 0.016 | 0.002 |
| 1.639999999999903 | 0.581 | 0.016 | 0.002 |
| 1.644999999999902 | 0.581 | 0.016 | 0.002 |
| 1.649999999999902 | 0.581 | 0.016 | 0.002 |
| 1.654999999999902 | 0.581 | 0.016 | 0.002 |
| 1.659999999999902 | 0.581 | 0.016 | 0.002 |
| 1.664999999999902 | 0.581 | 0.016 | 0.002 |
| 1.669999999999902 | 0.581 | 0.016 | 0.002 |
| 1.674999999999902 | 0.581 | 0.016 | 0.002 |
| 1.679999999999902 | 0.581 | 0.016 | 0.002 |
| 1.684999999999902 | 0.581 | 0.016 | 0.002 |
| 1.689999999999901 | 0.581 | 0.016 | 0.002 |
| 1.694999999999901 | 0.582 | 0.016 | 0.002 |
| 1.699999999999901 | 0.582 | 0.016 | 0.002 |
| 1.704999999999901 | 0.582 | 0.016 | 0.002 |
| 1.709999999999901 | 0.582 | 0.016 | 0.002 |
| 1.714999999999901 | 0.582 | 0.016 | 0.002 |
| 1.719999999999901 | 0.582 | 0.016 | 0.002 |
| 1.724999999999901 | 0.582 | 0.016 | 0.002 |
| 1.729999999999901 | 0.582 | 0.016 | 0.002 |
| 1.734999999999901 | 0.582 | 0.016 | 0.002 |
| 1.7399999999999 | 0.582 | 0.016 | 0.002 |
| 1.7449999999999 | 0.582 | 0.016 | 0.002 |
| 1.7499999999999 | 0.582 | 0.016 | 0.002 |
| 1.7549999999999 | 0.582 | 0.016 | 0.002 |
| 1.7599999999999 | 0.583 | 0.016 | 0.002 |
| 1.7649999999999 | 0.583 | 0.016 | 0.002 |
| 1.7699999999999 | 0.583 | 0.016 | 0.002 |
| 1.7749999999999 | 0.583 | 0.016 | 0.002 |
| 1.7799999999999 | 0.583 | 0.017 | 0.002 |
| 1.784999999999899 | 0.583 | 0.017 | 0.002 |
| 1.789999999999899 | 0.583 | 0.017 | 0.002 |
| 1.794999999999899 | 0.583 | 0.017 | 0.002 |
| 1.799999999999899 | 0.583 | 0.017 | 0.002 |
| 1.804999999999899 | 0.583 | 0.017 | 0.002 |
| 1.809999999999899 | 0.583 | 0.017 | 0.002 |
| 1.814999999999899 | 0.583 | 0.017 | 0.002 |
| 1.819999999999899 | 0.583 | 0.017 | 0.002 |
| 1.824999999999899 | 0.583 | 0.017 | 0.002 |
| 1.829999999999899 | 0.583 | 0.017 | 0.002 |
| 1.834999999999898 | 0.584 | 0.017 | 0.002 |
| 1.839999999999898 | 0.584 | 0.017 | 0.002 |
| 1.844999999999898 | 0.584 | 0.017 | 0.002 |
| 1.849999999999898 | 0.584 | 0.017 | 0.002 |
| 1.854999999999898 | 0.584 | 0.017 | 0.002 |
| 1.859999999999898 | 0.584 | 0.017 | 0.002 |
| 1.864999999999898 | 0.584 | 0.017 | 0.002 |
| 1.869999999999898 | 0.584 | 0.017 | 0.002 |
| 1.874999999999898 | 0.584 | 0.017 | 0.002 |
| 1.879999999999897 | 0.584 | 0.017 | 0.002 |
| 1.884999999999897 | 0.584 | 0.017 | 0.002 |
| 1.889999999999897 | 0.584 | 0.017 | 0.002 |
| 1.894999999999897 | 0.584 | 0.017 | 0.002 |
| 1.899999999999897 | 0.584 | 0.017 | 0.002 |
| 1.904999999999897 | 0.584 | 0.017 | 0.002 |
| 1.909999999999897 | 0.584 | 0.017 | 0.002 |
| 1.914999999999897 | 0.584 | 0.017 | 0.002 |
| 1.919999999999897 | 0.584 | 0.017 | 0.002 |
| 1.924999999999897 | 0.585 | 0.017 | 0.002 |
| 1.929999999999896 | 0.585 | 0.017 | 0.002 |
| 1.934999999999896 | 0.585 | 0.017 | 0.002 |
| 1.939999999999896 | 0.585 | 0.017 | 0.002 |
| 1.944999999999896 | 0.585 | 0.017 | 0.002 |
| 1.949999999999896 | 0.585 | 0.017 | 0.002 |
| 1.954999999999896 | 0.585 | 0.017 | 0.002 |
| 1.959999999999896 | 0.585 | 0.017 | 0.002 |
| 1.964999999999896 | 0.585 | 0.017 | 0.002 |
| 1.969999999999896 | 0.585 | 0.017 | 0.002 |
| 1.974999999999895 | 0.585 | 0.017 | 0.002 |
| 1.979999999999895 | 0.585 | 0.017 | 0.002 |
| 1.984999999999895 | 0.585 | 0.017 | 0.002 |
| 1.989999999999895 | 0.585 | 0.017 | 0.002 |
| 1.994999999999895 | 0.585 | 0.017 | 0.002 |
| 1.999999999999895 | 0.585 | 0.017 | 0.002 |
| 2.004999999999895 | 0.585 | 0.017 | 0.002 |
| 2.009999999999895 | 0.585 | 0.017 | 0.002 |
| 2.014999999999895 | 0.585 | 0.017 | 0.002 |
| 2.019999999999895 | 0.585 | 0.017 | 0.002 |
| 2.024999999999895 | 0.585 | 0.017 | 0.002 |
| 2.029999999999895 | 0.585 | 0.017 | 0.002 |
| 2.034999999999894 | 0.585 | 0.017 | 0.002 |
| 2.039999999999894 | 0.585 | 0.017 | 0.002 |
| 2.044999999999894 | 0.586 | 0.017 | 0.002 |
| 2.049999999999894 | 0.586 | 0.017 | 0.002 |
| 2.054999999999894 | 0.586 | 0.017 | 0.002 |
| 2.059999999999894 | 0.586 | 0.017 | 0.002 |
| 2.064999999999894 | 0.586 | 0.017 | 0.002 |
| 2.069999999999894 | 0.586 | 0.017 | 0.002 |
| 2.074999999999894 | 0.586 | 0.017 | 0.002 |
| 2.079999999999893 | 0.586 | 0.017 | 0.002 |
| 2.084999999999893 | 0.586 | 0.017 | 0.002 |
| 2.089999999999893 | 0.586 | 0.017 | 0.002 |
| 2.094999999999893 | 0.586 | 0.017 | 0.002 |
| 2.099999999999893 | 0.586 | 0.017 | 0.002 |
| 2.104999999999893 | 0.586 | 0.017 | 0.002 |
| 2.109999999999893 | 0.586 | 0.017 | 0.002 |
| 2.114999999999893 | 0.586 | 0.017 | 0.002 |
| 2.119999999999893 | 0.586 | 0.017 | 0.002 |
| 2.124999999999893 | 0.586 | 0.017 | 0.002 |
| 2.129999999999892 | 0.586 | 0.017 | 0.002 |
| 2.134999999999892 | 0.586 | 0.017 | 0.002 |
| 2.139999999999892 | 0.586 | 0.017 | 0.002 |
| 2.144999999999892 | 0.586 | 0.017 | 0.002 |
| 2.149999999999892 | 0.586 | 0.017 | 0.002 |
| 2.154999999999892 | 0.586 | 0.017 | 0.002 |
| 2.159999999999892 | 0.586 | 0.017 | 0.002 |
| 2.164999999999892 | 0.586 | 0.017 | 0.002 |
| 2.169999999999892 | 0.586 | 0.017 | 0.002 |
| 2.174999999999891 | 0.586 | 0.017 | 0.002 |
| 2.179999999999891 | 0.586 | 0.017 | 0.002 |
| 2.184999999999891 | 0.586 | 0.017 | 0.002 |
| 2.189999999999891 | 0.586 | 0.017 | 0.002 |
| 2.194999999999891 | 0.586 | 0.017 | 0.002 |
| 2.199999999999891 | 0.586 | 0.017 | 0.002 |
| 2.204999999999891 | 0.586 | 0.017 | 0.002 |
| 2.209999999999891 | 0.587 | 0.017 | 0.002 |
| 2.214999999999891 | 0.587 | 0.017 | 0.002 |
| 2.21999999999989 | 0.587 | 0.017 | 0.002 |
| 2.22499999999989 | 0.587 | 0.017 | 0.002 |
| 2.22999999999989 | 0.587 | 0.017 | 0.002 |
| 2.23499999999989 | 0.587 | 0.017 | 0.002 |
| 2.23999999999989 | 0.587 | 0.017 | 0.002 |
| 2.24499999999989 | 0.587 | 0.017 | 0.002 |
| 2.24999999999989 | 0.587 | 0.017 | 0.002 |
| 2.25499999999989 | 0.587 | 0.017 | 0.002 |
| 2.25999999999989 | 0.587 | 0.017 | 0.002 |
| 2.26499999999989 | 0.587 | 0.017 | 0.002 |
| 2.269999999999889 | 0.587 | 0.017 | 0.002 |
| 2.274999999999889 | 0.587 | 0.017 | 0.002 |
| 2.279999999999889 | 0.587 | 0.017 | 0.002 |
| 2.284999999999889 | 0.587 | 0.017 | 0.002 |
| 2.289999999999889 | 0.587 | 0.017 | 0.002 |
| 2.294999999999889 | 0.587 | 0.017 | 0.002 |
| 2.299999999999889 | 0.587 | 0.017 | 0.002 |
| 2.304999999999889 | 0.587 | 0.017 | 0.002 |
| 2.309999999999889 | 0.587 | 0.018 | 0.002 |
| 2.314999999999888 | 0.587 | 0.018 | 0.002 |
| 2.319999999999888 | 0.587 | 0.018 | 0.002 |
| 2.324999999999888 | 0.587 | 0.018 | 0.002 |
| 2.329999999999888 | 0.587 | 0.018 | 0.002 |
| 2.334999999999888 | 0.587 | 0.018 | 0.002 |
| 2.339999999999888 | 0.587 | 0.018 | 0.002 |
| 2.344999999999888 | 0.587 | 0.018 | 0.002 |
| 2.349999999999888 | 0.587 | 0.018 | 0.002 |
| 2.354999999999888 | 0.587 | 0.018 | 0.002 |
| 2.359999999999887 | 0.587 | 0.018 | 0.002 |
| 2.364999999999887 | 0.587 | 0.018 | 0.002 |
| 2.369999999999887 | 0.587 | 0.018 | 0.002 |
| 2.374999999999887 | 0.587 | 0.018 | 0.002 |
| 2.379999999999887 | 0.587 | 0.018 | 0.002 |
| 2.384999999999887 | 0.587 | 0.018 | 0.002 |
| 2.389999999999887 | 0.587 | 0.018 | 0.002 |
| 2.394999999999887 | 0.587 | 0.018 | 0.002 |
| 2.399999999999887 | 0.587 | 0.018 | 0.002 |
| 2.404999999999887 | 0.587 | 0.018 | 0.002 |
| 2.409999999999886 | 0.587 | 0.018 | 0.002 |
| 2.414999999999886 | 0.587 | 0.018 | 0.002 |
| 2.419999999999886 | 0.587 | 0.018 | 0.002 |
| 2.424999999999886 | 0.587 | 0.018 | 0.002 |
| 2.429999999999886 | 0.587 | 0.018 | 0.002 |
| 2.434999999999886 | 0.587 | 0.018 | 0.002 |
| 2.439999999999886 | 0.587 | 0.018 | 0.002 |
| 2.444999999999886 | 0.587 | 0.018 | 0.002 |
| 2.449999999999886 | 0.587 | 0.018 | 0.002 |
| 2.454999999999885 | 0.587 | 0.018 | 0.002 |
| 2.459999999999885 | 0.587 | 0.018 | 0.002 |
| 2.464999999999885 | 0.587 | 0.018 | 0.002 |
| 2.469999999999885 | 0.587 | 0.018 | 0.002 |
| 2.474999999999885 | 0.587 | 0.018 | 0.002 |
| 2.479999999999885 | 0.588 | 0.018 | 0.002 |
| 2.484999999999885 | 0.588 | 0.018 | 0.002 |
| 2.489999999999885 | 0.588 | 0.018 | 0.002 |
| 2.494999999999885 | 0.588 | 0.018 | 0.002 |
| 2.499999999999884 | 0.588 | 0.018 | 0.002 |
| 2.504999999999884 | 0.588 | 0.018 | 0.002 |
| 2.509999999999884 | 0.588 | 0.018 | 0.002 |
| 2.514999999999884 | 0.588 | 0.018 | 0.002 |
| 2.519999999999884 | 0.588 | 0.018 | 0.002 |
| 2.524999999999884 | 0.588 | 0.018 | 0.002 |
| 2.529999999999884 | 0.588 | 0.018 | 0.002 |
| 2.534999999999884 | 0.588 | 0.018 | 0.002 |
| 2.539999999999884 | 0.588 | 0.018 | 0.002 |
| 2.544999999999884 | 0.588 | 0.018 | 0.002 |
| 2.549999999999883 | 0.588 | 0.018 | 0.002 |
| 2.554999999999883 | 0.588 | 0.018 | 0.002 |
| 2.559999999999883 | 0.588 | 0.018 | 0.002 |
| 2.564999999999883 | 0.588 | 0.018 | 0.002 |
| 2.569999999999883 | 0.588 | 0.018 | 0.002 |
| 2.574999999999883 | 0.588 | 0.018 | 0.002 |
| 2.579999999999883 | 0.588 | 0.018 | 0.002 |
| 2.584999999999883 | 0.588 | 0.018 | 0.002 |
| 2.589999999999883 | 0.588 | 0.018 | 0.002 |
| 2.594999999999882 | 0.588 | 0.018 | 0.002 |
| 2.599999999999882 | 0.588 | 0.018 | 0.002 |
| 2.604999999999882 | 0.588 | 0.018 | 0.002 |
| 2.609999999999882 | 0.588 | 0.018 | 0.002 |
| 2.614999999999882 | 0.588 | 0.018 | 0.002 |
| 2.619999999999882 | 0.588 | 0.018 | 0.002 |
| 2.624999999999882 | 0.588 | 0.018 | 0.002 |
| 2.629999999999882 | 0.588 | 0.018 | 0.002 |
| 2.634999999999882 | 0.588 | 0.018 | 0.002 |
| 2.639999999999881 | 0.588 | 0.018 | 0.002 |
| 2.644999999999881 | 0.588 | 0.018 | 0.002 |
| 2.649999999999881 | 0.588 | 0.018 | 0.002 |
| 2.654999999999881 | 0.588 | 0.018 | 0.002 |
| 2.659999999999881 | 0.588 | 0.018 | 0.002 |
| 2.664999999999881 | 0.588 | 0.018 | 0.002 |
| 2.669999999999881 | 0.588 | 0.018 | 0.002 |
| 2.674999999999881 | 0.588 | 0.018 | 0.002 |
| 2.679999999999881 | 0.588 | 0.018 | 0.002 |
| 2.68499999999988 | 0.588 | 0.018 | 0.002 |
| 2.68999999999988 | 0.588 | 0.018 | 0.002 |
| 2.69499999999988 | 0.588 | 0.018 | 0.002 |
| 2.69999999999988 | 0.588 | 0.018 | 0.002 |
| 2.70499999999988 | 0.588 | 0.018 | 0.002 |
| 2.70999999999988 | 0.588 | 0.018 | 0.002 |
| 2.71499999999988 | 0.588 | 0.018 | 0.002 |
| 2.71999999999988 | 0.588 | 0.018 | 0.002 |
| 2.72499999999988 | 0.588 | 0.018 | 0.002 |
| 2.72999999999988 | 0.588 | 0.018 | 0.002 |
| 2.734999999999879 | 0.588 | 0.018 | 0.002 |
| 2.739999999999879 | 0.588 | 0.018 | 0.002 |
| 2.744999999999879 | 0.588 | 0.018 | 0.002 |
| 2.749999999999879 | 0.588 | 0.018 | 0.002 |
| 2.754999999999879 | 0.588 | 0.018 | 0.002 |
| 2.759999999999879 | 0.588 | 0.018 | 0.002 |
| 2.764999999999879 | 0.588 | 0.018 | 0.002 |
| 2.769999999999879 | 0.588 | 0.018 | 0.002 |
| 2.774999999999879 | 0.588 | 0.018 | 0.002 |
| 2.779999999999878 | 0.588 | 0.018 | 0.002 |
| 2.784999999999878 | 0.588 | 0.018 | 0.002 |
| 2.789999999999878 | 0.588 | 0.018 | 0.002 |
| 2.794999999999878 | 0.588 | 0.018 | 0.002 |
| 2.799999999999878 | 0.588 | 0.018 | 0.002 |
| 2.804999999999878 | 0.588 | 0.018 | 0.002 |
| 2.809999999999878 | 0.588 | 0.018 | 0.002 |
| 2.814999999999878 | 0.588 | 0.018 | 0.002 |
| 2.819999999999878 | 0.588 | 0.018 | 0.002 |
| 2.824999999999878 | 0.588 | 0.018 | 0.002 |
| 2.829999999999877 | 0.588 | 0.018 | 0.002 |
| 2.834999999999877 | 0.588 | 0.018 | 0.002 |
| 2.839999999999877 | 0.588 | 0.018 | 0.002 |
| 2.844999999999877 | 0.588 | 0.018 | 0.002 |
| 2.849999999999877 | 0.588 | 0.018 | 0.002 |
| 2.854999999999877 | 0.588 | 0.018 | 0.002 |
| 2.859999999999877 | 0.588 | 0.018 | 0.002 |
| 2.864999999999877 | 0.588 | 0.018 | 0.002 |
| 2.869999999999877 | 0.588 | 0.018 | 0.002 |
| 2.874999999999876 | 0.588 | 0.018 | 0.002 |
| 2.879999999999876 | 0.588 | 0.018 | 0.002 |
| 2.884999999999876 | 0.588 | 0.018 | 0.002 |
| 2.889999999999876 | 0.588 | 0.018 | 0.002 |
| 2.894999999999876 | 0.588 | 0.018 | 0.002 |
| 2.899999999999876 | 0.588 | 0.018 | 0.002 |
| 2.904999999999876 | 0.588 | 0.018 | 0.002 |
| 2.909999999999876 | 0.588 | 0.018 | 0.002 |
| 2.914999999999876 | 0.588 | 0.018 | 0.002 |
| 2.919999999999876 | 0.588 | 0.018 | 0.002 |
| 2.924999999999875 | 0.588 | 0.018 | 0.002 |
| 2.929999999999875 | 0.588 | 0.018 | 0.002 |
| 2.934999999999875 | 0.588 | 0.018 | 0.002 |
| 2.939999999999875 | 0.588 | 0.018 | 0.002 |
| 2.944999999999875 | 0.588 | 0.018 | 0.002 |
| 2.949999999999875 | 0.588 | 0.018 | 0.002 |
| 2.954999999999875 | 0.588 | 0.018 | 0.002 |
| 2.959999999999875 | 0.588 | 0.018 | 0.002 |
| 2.964999999999875 | 0.588 | 0.018 | 0.002 |
| 2.969999999999874 | 0.588 | 0.018 | 0.002 |
| 2.974999999999874 | 0.588 | 0.018 | 0.002 |
| 2.979999999999874 | 0.588 | 0.018 | 0.002 |
| 2.984999999999874 | 0.588 | 0.018 | 0.002 |
| 2.989999999999874 | 0.588 | 0.018 | 0.002 |
| 2.994999999999874 | 0.588 | 0.018 | 0.002 |
| 2.999999999999874 | 0.588 | 0.018 | 0.002 |
| 3.004999999999874 | 0.588 | 0.018 | 0.002 |
| 3.009999999999874 | 0.588 | 0.018 | 0.002 |
| 3.014999999999874 | 0.588 | 0.018 | 0.002 |
| 3.019999999999873 | 0.588 | 0.018 | 0.002 |
| 3.024999999999873 | 0.588 | 0.018 | 0.002 |
| 3.029999999999873 | 0.588 | 0.018 | 0.002 |
| 3.034999999999873 | 0.588 | 0.018 | 0.002 |
| 3.039999999999873 | 0.588 | 0.018 | 0.002 |
| 3.044999999999873 | 0.588 | 0.018 | 0.002 |
| 3.049999999999873 | 0.588 | 0.018 | 0.002 |
| 3.054999999999873 | 0.588 | 0.018 | 0.002 |
| 3.059999999999873 | 0.588 | 0.018 | 0.002 |
| 3.064999999999872 | 0.588 | 0.018 | 0.002 |
| 3.069999999999872 | 0.588 | 0.018 | 0.002 |
| 3.074999999999872 | 0.588 | 0.018 | 0.002 |
| 3.079999999999872 | 0.588 | 0.018 | 0.002 |
| 3.084999999999872 | 0.588 | 0.018 | 0.002 |
| 3.089999999999872 | 0.588 | 0.018 | 0.002 |
| 3.094999999999872 | 0.588 | 0.018 | 0.002 |
| 3.099999999999872 | 0.588 | 0.018 | 0.002 |
| 3.104999999999872 | 0.588 | 0.018 | 0.002 |
| 3.109999999999872 | 0.588 | 0.018 | 0.002 |
| 3.114999999999871 | 0.588 | 0.018 | 0.002 |
| 3.119999999999871 | 0.589 | 0.018 | 0.002 |
| 3.124999999999871 | 0.589 | 0.018 | 0.002 |
| 3.129999999999871 | 0.589 | 0.018 | 0.002 |
| 3.134999999999871 | 0.589 | 0.018 | 0.002 |
| 3.139999999999871 | 0.589 | 0.018 | 0.002 |
| 3.144999999999871 | 0.589 | 0.018 | 0.002 |
| 3.149999999999871 | 0.589 | 0.018 | 0.002 |
| 3.154999999999871 | 0.589 | 0.018 | 0.002 |
| 3.15999999999987 | 0.589 | 0.018 | 0.002 |
| 3.16499999999987 | 0.589 | 0.018 | 0.002 |
| 3.16999999999987 | 0.589 | 0.018 | 0.002 |
| 3.17499999999987 | 0.589 | 0.018 | 0.002 |
| 3.17999999999987 | 0.589 | 0.018 | 0.002 |
| 3.18499999999987 | 0.589 | 0.018 | 0.002 |
| 3.18999999999987 | 0.589 | 0.018 | 0.002 |
| 3.19499999999987 | 0.589 | 0.018 | 0.002 |
| 3.19999999999987 | 0.589 | 0.018 | 0.002 |
| 3.204999999999869 | 0.589 | 0.018 | 0.002 |
| 3.209999999999869 | 0.589 | 0.018 | 0.002 |
| 3.214999999999869 | 0.589 | 0.018 | 0.002 |
| 3.219999999999869 | 0.589 | 0.018 | 0.002 |
| 3.224999999999869 | 0.589 | 0.018 | 0.002 |
| 3.229999999999869 | 0.589 | 0.018 | 0.002 |
| 3.234999999999869 | 0.589 | 0.018 | 0.002 |
| 3.239999999999869 | 0.589 | 0.018 | 0.002 |
| 3.244999999999869 | 0.589 | 0.018 | 0.002 |
| 3.249999999999869 | 0.589 | 0.018 | 0.002 |
| 3.254999999999868 | 0.589 | 0.018 | 0.002 |
| 3.259999999999868 | 0.589 | 0.018 | 0.002 |
| 3.264999999999868 | 0.589 | 0.018 | 0.002 |
| 3.269999999999868 | 0.589 | 0.018 | 0.002 |
| 3.274999999999868 | 0.589 | 0.018 | 0.002 |
| 3.279999999999868 | 0.589 | 0.018 | 0.002 |
| 3.284999999999868 | 0.589 | 0.018 | 0.002 |
| 3.289999999999868 | 0.589 | 0.018 | 0.002 |
| 3.294999999999868 | 0.589 | 0.018 | 0.002 |
| 3.299999999999867 | 0.589 | 0.018 | 0.002 |
| 3.304999999999867 | 0.589 | 0.018 | 0.002 |
| 3.309999999999867 | 0.589 | 0.018 | 0.002 |
| 3.314999999999867 | 0.589 | 0.018 | 0.002 |
| 3.319999999999867 | 0.589 | 0.018 | 0.002 |
| 3.324999999999867 | 0.589 | 0.018 | 0.002 |
| 3.329999999999867 | 0.589 | 0.018 | 0.002 |
| 3.334999999999867 | 0.589 | 0.018 | 0.002 |
| 3.339999999999867 | 0.589 | 0.018 | 0.002 |
| 3.344999999999866 | 0.589 | 0.018 | 0.002 |
| 3.349999999999866 | 0.589 | 0.018 | 0.002 |
| 3.354999999999866 | 0.589 | 0.018 | 0.002 |
| 3.359999999999866 | 0.589 | 0.018 | 0.002 |
| 3.364999999999866 | 0.589 | 0.018 | 0.002 |
| 3.369999999999866 | 0.589 | 0.018 | 0.002 |
| 3.374999999999866 | 0.589 | 0.018 | 0.002 |
| 3.379999999999866 | 0.589 | 0.018 | 0.002 |
| 3.384999999999866 | 0.589 | 0.018 | 0.002 |
| 3.389999999999866 | 0.589 | 0.018 | 0.002 |
| 3.394999999999865 | 0.589 | 0.018 | 0.002 |
| 3.399999999999865 | 0.589 | 0.018 | 0.002 |
| 3.404999999999865 | 0.589 | 0.018 | 0.002 |
| 3.409999999999865 | 0.589 | 0.018 | 0.002 |
| 3.414999999999865 | 0.589 | 0.018 | 0.002 |
| 3.419999999999865 | 0.589 | 0.018 | 0.002 |
| 3.424999999999865 | 0.589 | 0.018 | 0.002 |
| 3.429999999999865 | 0.589 | 0.018 | 0.002 |
| 3.434999999999865 | 0.589 | 0.018 | 0.002 |
| 3.439999999999864 | 0.589 | 0.018 | 0.002 |
| 3.444999999999864 | 0.589 | 0.018 | 0.002 |
| 3.449999999999864 | 0.589 | 0.018 | 0.002 |
| 3.454999999999864 | 0.589 | 0.018 | 0.002 |
| 3.459999999999864 | 0.589 | 0.018 | 0.002 |
| 3.464999999999864 | 0.589 | 0.018 | 0.002 |
| 3.469999999999864 | 0.589 | 0.018 | 0.002 |
| 3.474999999999864 | 0.589 | 0.018 | 0.002 |
| 3.479999999999864 | 0.589 | 0.018 | 0.002 |
| 3.484999999999864 | 0.589 | 0.018 | 0.002 |
| 3.489999999999863 | 0.589 | 0.018 | 0.002 |
| 3.494999999999863 | 0.589 | 0.018 | 0.002 |
| 3.499999999999863 | 0.589 | 0.018 | 0.002 |
| 3.504999999999863 | 0.589 | 0.018 | 0.002 |
| 3.509999999999863 | 0.589 | 0.018 | 0.002 |
| 3.514999999999863 | 0.589 | 0.018 | 0.002 |
| 3.519999999999863 | 0.589 | 0.018 | 0.002 |
| 3.524999999999863 | 0.589 | 0.018 | 0.002 |
| 3.529999999999863 | 0.589 | 0.018 | 0.002 |
| 3.534999999999862 | 0.589 | 0.018 | 0.002 |
| 3.539999999999862 | 0.589 | 0.018 | 0.002 |
| 3.544999999999862 | 0.589 | 0.018 | 0.002 |
| 3.549999999999862 | 0.589 | 0.018 | 0.002 |
| 3.554999999999862 | 0.589 | 0.018 | 0.002 |
| 3.559999999999862 | 0.589 | 0.018 | 0.002 |
| 3.564999999999862 | 0.589 | 0.018 | 0.002 |
| 3.569999999999862 | 0.589 | 0.018 | 0.002 |
| 3.574999999999862 | 0.589 | 0.018 | 0.002 |
| 3.579999999999862 | 0.589 | 0.018 | 0.002 |
| 3.584999999999861 | 0.589 | 0.018 | 0.002 |
| 3.589999999999861 | 0.589 | 0.018 | 0.002 |
| 3.594999999999861 | 0.589 | 0.018 | 0.002 |
| 3.599999999999861 | 0.589 | 0.018 | 0.002 |
| 3.604999999999861 | 0.589 | 0.018 | 0.002 |
| 3.609999999999861 | 0.589 | 0.018 | 0.002 |
| 3.614999999999861 | 0.589 | 0.018 | 0.002 |
| 3.619999999999861 | 0.589 | 0.018 | 0.002 |
| 3.62499999999986 | 0.589 | 0.018 | 0.002 |
| 3.62999999999986 | 0.589 | 0.018 | 0.002 |
| 3.63499999999986 | 0.589 | 0.018 | 0.002 |
| 3.63999999999986 | 0.589 | 0.018 | 0.002 |
| 3.64499999999986 | 0.589 | 0.018 | 0.002 |
| 3.64999999999986 | 0.589 | 0.018 | 0.002 |
| 3.65499999999986 | 0.589 | 0.018 | 0.002 |
| 3.65999999999986 | 0.589 | 0.018 | 0.002 |
| 3.66499999999986 | 0.589 | 0.018 | 0.002 |
| 3.669999999999859 | 0.589 | 0.018 | 0.002 |
| 3.674999999999859 | 0.589 | 0.018 | 0.002 |
| 3.679999999999859 | 0.589 | 0.018 | 0.002 |
| 3.684999999999859 | 0.589 | 0.018 | 0.002 |
| 3.689999999999859 | 0.589 | 0.018 | 0.002 |
| 3.694999999999859 | 0.589 | 0.018 | 0.002 |
| 3.699999999999859 | 0.589 | 0.018 | 0.002 |
| 3.704999999999859 | 0.589 | 0.018 | 0.002 |
| 3.709999999999859 | 0.589 | 0.018 | 0.002 |
| 3.714999999999859 | 0.589 | 0.018 | 0.002 |
| 3.719999999999858 | 0.589 | 0.018 | 0.002 |
| 3.724999999999858 | 0.589 | 0.018 | 0.002 |
| 3.729999999999858 | 0.589 | 0.018 | 0.002 |
| 3.734999999999858 | 0.589 | 0.018 | 0.002 |
| 3.739999999999858 | 0.589 | 0.018 | 0.002 |
| 3.744999999999858 | 0.589 | 0.018 | 0.002 |
| 3.749999999999858 | 0.589 | 0.018 | 0.002 |
| 3.754999999999858 | 0.589 | 0.018 | 0.002 |
| 3.759999999999858 | 0.589 | 0.018 | 0.002 |
| 3.764999999999857 | 0.589 | 0.018 | 0.002 |
| 3.769999999999857 | 0.589 | 0.018 | 0.002 |
| 3.774999999999857 | 0.589 | 0.018 | 0.002 |
| 3.779999999999857 | 0.589 | 0.018 | 0.002 |
| 3.784999999999857 | 0.589 | 0.018 | 0.002 |
| 3.789999999999857 | 0.589 | 0.018 | 0.002 |
| 3.794999999999857 | 0.589 | 0.018 | 0.002 |
| 3.799999999999857 | 0.589 | 0.018 | 0.002 |
| 3.804999999999857 | 0.589 | 0.018 | 0.002 |
| 3.809999999999857 | 0.589 | 0.018 | 0.002 |
| 3.814999999999856 | 0.589 | 0.018 | 0.002 |
| 3.819999999999856 | 0.589 | 0.018 | 0.002 |
| 3.824999999999856 | 0.589 | 0.018 | 0.002 |
| 3.829999999999856 | 0.589 | 0.018 | 0.002 |
| 3.834999999999856 | 0.589 | 0.018 | 0.002 |
| 3.839999999999856 | 0.589 | 0.018 | 0.002 |
| 3.844999999999856 | 0.589 | 0.018 | 0.002 |
| 3.849999999999856 | 0.589 | 0.018 | 0.002 |
| 3.854999999999856 | 0.589 | 0.018 | 0.002 |
| 3.859999999999855 | 0.589 | 0.018 | 0.002 |
| 3.864999999999855 | 0.589 | 0.018 | 0.002 |
| 3.869999999999855 | 0.589 | 0.018 | 0.002 |
| 3.874999999999855 | 0.589 | 0.018 | 0.002 |
| 3.879999999999855 | 0.589 | 0.018 | 0.002 |
| 3.884999999999855 | 0.589 | 0.018 | 0.002 |
| 3.889999999999855 | 0.589 | 0.018 | 0.002 |
| 3.894999999999855 | 0.589 | 0.018 | 0.002 |
| 3.899999999999855 | 0.589 | 0.018 | 0.002 |
| 3.904999999999855 | 0.589 | 0.018 | 0.002 |
| 3.909999999999854 | 0.589 | 0.018 | 0.002 |
| 3.914999999999854 | 0.589 | 0.018 | 0.002 |
| 3.919999999999854 | 0.589 | 0.018 | 0.002 |
| 3.924999999999854 | 0.589 | 0.018 | 0.002 |
| 3.929999999999854 | 0.589 | 0.018 | 0.002 |
| 3.934999999999854 | 0.589 | 0.018 | 0.002 |
| 3.939999999999854 | 0.589 | 0.018 | 0.002 |
| 3.944999999999854 | 0.589 | 0.018 | 0.002 |
| 3.949999999999854 | 0.589 | 0.018 | 0.002 |
| 3.954999999999853 | 0.589 | 0.018 | 0.002 |
| 3.959999999999853 | 0.589 | 0.018 | 0.002 |
| 3.964999999999853 | 0.589 | 0.018 | 0.002 |
| 3.969999999999853 | 0.589 | 0.018 | 0.002 |
| 3.974999999999853 | 0.589 | 0.018 | 0.002 |
| 3.979999999999853 | 0.589 | 0.018 | 0.002 |
| 3.984999999999853 | 0.589 | 0.018 | 0.002 |
| 3.989999999999853 | 0.589 | 0.018 | 0.002 |
| 3.994999999999853 | 0.589 | 0.018 | 0.002 |
| 3.999999999999853 | 0.589 | 0.018 | 0.002 |
| 4.004999999999852 | 0.589 | 0.018 | 0.002 |
| 4.009999999999852 | 0.589 | 0.018 | 0.002 |
| 4.014999999999852 | 0.589 | 0.018 | 0.002 |
| 4.019999999999852 | 0.589 | 0.018 | 0.002 |
| 4.024999999999852 | 0.589 | 0.018 | 0.002 |
| 4.029999999999852 | 0.589 | 0.018 | 0.002 |
| 4.034999999999852 | 0.589 | 0.018 | 0.002 |
| 4.039999999999851 | 0.589 | 0.018 | 0.002 |
| 4.044999999999852 | 0.589 | 0.018 | 0.002 |
| 4.049999999999851 | 0.589 | 0.018 | 0.002 |
| 4.054999999999851 | 0.589 | 0.018 | 0.002 |
| 4.059999999999851 | 0.589 | 0.018 | 0.002 |
| 4.064999999999851 | 0.589 | 0.018 | 0.002 |
| 4.069999999999851 | 0.589 | 0.018 | 0.002 |
| 4.074999999999851 | 0.589 | 0.018 | 0.002 |
| 4.07999999999985 | 0.589 | 0.018 | 0.002 |
| 4.084999999999851 | 0.589 | 0.018 | 0.002 |
| 4.08999999999985 | 0.589 | 0.018 | 0.002 |
| 4.094999999999851 | 0.589 | 0.018 | 0.002 |
| 4.09999999999985 | 0.589 | 0.018 | 0.002 |
| 4.10499999999985 | 0.589 | 0.018 | 0.002 |
| 4.10999999999985 | 0.589 | 0.018 | 0.002 |
| 4.11499999999985 | 0.589 | 0.018 | 0.002 |
| 4.11999999999985 | 0.589 | 0.018 | 0.002 |
| 4.12499999999985 | 0.589 | 0.018 | 0.002 |
| 4.12999999999985 | 0.589 | 0.018 | 0.002 |
| 4.13499999999985 | 0.589 | 0.018 | 0.002 |
| 4.13999999999985 | 0.589 | 0.018 | 0.002 |
| 4.144999999999849 | 0.589 | 0.018 | 0.002 |
| 4.14999999999985 | 0.589 | 0.018 | 0.002 |
| 4.154999999999849 | 0.589 | 0.018 | 0.002 |
| 4.15999999999985 | 0.589 | 0.018 | 0.002 |
| 4.164999999999849 | 0.589 | 0.018 | 0.002 |
| 4.169999999999849 | 0.589 | 0.018 | 0.002 |
| 4.174999999999849 | 0.589 | 0.018 | 0.002 |
| 4.179999999999848 | 0.589 | 0.018 | 0.002 |
| 4.184999999999849 | 0.589 | 0.018 | 0.002 |
| 4.189999999999848 | 0.589 | 0.018 | 0.002 |
| 4.194999999999848 | 0.589 | 0.018 | 0.002 |
| 4.199999999999848 | 0.589 | 0.018 | 0.002 |
| 4.204999999999848 | 0.589 | 0.018 | 0.002 |
| 4.209999999999848 | 0.589 | 0.018 | 0.002 |
| 4.214999999999848 | 0.589 | 0.018 | 0.002 |
| 4.219999999999847 | 0.589 | 0.018 | 0.002 |
| 4.224999999999848 | 0.589 | 0.018 | 0.002 |
| 4.229999999999847 | 0.589 | 0.018 | 0.002 |
| 4.234999999999847 | 0.589 | 0.018 | 0.002 |
| 4.239999999999847 | 0.589 | 0.018 | 0.002 |
| 4.244999999999847 | 0.589 | 0.018 | 0.002 |
| 4.249999999999847 | 0.589 | 0.018 | 0.002 |
| 4.254999999999847 | 0.589 | 0.018 | 0.002 |
| 4.259999999999846 | 0.589 | 0.018 | 0.002 |
| 4.264999999999847 | 0.589 | 0.018 | 0.002 |
| 4.269999999999846 | 0.589 | 0.018 | 0.002 |
| 4.274999999999846 | 0.589 | 0.018 | 0.002 |
| 4.279999999999846 | 0.589 | 0.018 | 0.002 |
| 4.284999999999846 | 0.589 | 0.018 | 0.002 |
| 4.289999999999846 | 0.589 | 0.018 | 0.002 |
| 4.294999999999846 | 0.589 | 0.018 | 0.002 |
| 4.299999999999846 | 0.589 | 0.018 | 0.002 |
| 4.304999999999846 | 0.589 | 0.018 | 0.002 |
| 4.309999999999845 | 0.589 | 0.018 | 0.002 |
| 4.314999999999846 | 0.589 | 0.018 | 0.002 |
| 4.319999999999845 | 0.589 | 0.018 | 0.002 |
| 4.324999999999846 | 0.589 | 0.018 | 0.002 |
| 4.329999999999845 | 0.589 | 0.018 | 0.002 |
| 4.334999999999845 | 0.589 | 0.018 | 0.002 |
| 4.339999999999845 | 0.589 | 0.018 | 0.002 |
| 4.344999999999845 | 0.589 | 0.018 | 0.002 |
| 4.349999999999845 | 0.589 | 0.018 | 0.002 |
| 4.354999999999845 | 0.589 | 0.018 | 0.002 |
| 4.359999999999844 | 0.589 | 0.018 | 0.002 |
| 4.364999999999845 | 0.589 | 0.018 | 0.002 |
| 4.369999999999844 | 0.589 | 0.018 | 0.002 |
| 4.374999999999844 | 0.589 | 0.018 | 0.002 |
| 4.379999999999844 | 0.589 | 0.018 | 0.002 |
| 4.384999999999844 | 0.589 | 0.018 | 0.002 |
| 4.389999999999844 | 0.589 | 0.018 | 0.002 |
| 4.394999999999844 | 0.589 | 0.018 | 0.002 |
| 4.399999999999844 | 0.589 | 0.018 | 0.002 |
| 4.404999999999844 | 0.589 | 0.018 | 0.002 |
| 4.409999999999843 | 0.589 | 0.018 | 0.002 |
| 4.414999999999844 | 0.589 | 0.018 | 0.002 |
| 4.419999999999843 | 0.589 | 0.018 | 0.002 |
| 4.424999999999843 | 0.589 | 0.018 | 0.002 |
| 4.429999999999843 | 0.589 | 0.018 | 0.002 |
| 4.434999999999843 | 0.589 | 0.018 | 0.002 |
| 4.439999999999843 | 0.589 | 0.018 | 0.002 |
| 4.444999999999843 | 0.589 | 0.018 | 0.002 |
| 4.449999999999842 | 0.589 | 0.018 | 0.002 |
| 4.454999999999843 | 0.589 | 0.018 | 0.002 |
| 4.459999999999842 | 0.589 | 0.018 | 0.002 |
| 4.464999999999843 | 0.589 | 0.018 | 0.002 |
| 4.469999999999842 | 0.589 | 0.018 | 0.002 |
| 4.474999999999842 | 0.589 | 0.018 | 0.002 |
| 4.479999999999842 | 0.589 | 0.018 | 0.002 |
| 4.484999999999842 | 0.589 | 0.018 | 0.002 |
| 4.489999999999842 | 0.589 | 0.018 | 0.002 |
| 4.494999999999842 | 0.589 | 0.018 | 0.002 |
| 4.499999999999841 | 0.589 | 0.018 | 0.002 |
| 4.504999999999842 | 0.589 | 0.018 | 0.002 |
| 4.509999999999841 | 0.589 | 0.018 | 0.002 |
| 4.514999999999842 | 0.589 | 0.018 | 0.002 |
| 4.519999999999841 | 0.589 | 0.018 | 0.002 |
| 4.524999999999841 | 0.589 | 0.018 | 0.002 |
| 4.529999999999841 | 0.589 | 0.018 | 0.002 |
| 4.534999999999841 | 0.589 | 0.018 | 0.002 |
| 4.53999999999984 | 0.589 | 0.018 | 0.002 |
| 4.544999999999841 | 0.589 | 0.018 | 0.002 |
| 4.54999999999984 | 0.589 | 0.018 | 0.002 |
| 4.554999999999841 | 0.589 | 0.018 | 0.002 |
| 4.55999999999984 | 0.589 | 0.018 | 0.002 |
| 4.564999999999841 | 0.589 | 0.018 | 0.002 |
| 4.56999999999984 | 0.589 | 0.018 | 0.002 |
| 4.57499999999984 | 0.589 | 0.018 | 0.002 |
| 4.57999999999984 | 0.589 | 0.018 | 0.002 |
| 4.58499999999984 | 0.589 | 0.018 | 0.002 |
| 4.58999999999984 | 0.589 | 0.018 | 0.002 |
| 4.59499999999984 | 0.589 | 0.018 | 0.002 |
| 4.59999999999984 | 0.589 | 0.018 | 0.002 |
| 4.60499999999984 | 0.589 | 0.018 | 0.002 |
| 4.60999999999984 | 0.589 | 0.018 | 0.002 |
| 4.614999999999839 | 0.589 | 0.018 | 0.002 |
| 4.61999999999984 | 0.589 | 0.018 | 0.002 |
| 4.624999999999839 | 0.589 | 0.018 | 0.002 |
| 4.62999999999984 | 0.589 | 0.018 | 0.002 |
| 4.634999999999839 | 0.589 | 0.018 | 0.002 |
| 4.639999999999838 | 0.589 | 0.018 | 0.002 |
| 4.644999999999839 | 0.589 | 0.018 | 0.002 |
| 4.649999999999838 | 0.589 | 0.018 | 0.002 |
| 4.654999999999839 | 0.589 | 0.018 | 0.002 |
| 4.659999999999838 | 0.589 | 0.018 | 0.002 |
| 4.664999999999838 | 0.589 | 0.018 | 0.002 |
| 4.669999999999838 | 0.589 | 0.018 | 0.002 |
| 4.674999999999838 | 0.589 | 0.018 | 0.002 |
| 4.679999999999837 | 0.589 | 0.018 | 0.002 |
| 4.684999999999838 | 0.589 | 0.018 | 0.002 |
| 4.689999999999837 | 0.589 | 0.018 | 0.002 |
| 4.694999999999838 | 0.589 | 0.018 | 0.002 |
| 4.699999999999837 | 0.589 | 0.018 | 0.002 |
| 4.704999999999837 | 0.589 | 0.018 | 0.002 |
| 4.709999999999837 | 0.589 | 0.018 | 0.002 |
| 4.714999999999837 | 0.589 | 0.018 | 0.002 |
| 4.719999999999837 | 0.589 | 0.018 | 0.002 |
| 4.724999999999837 | 0.589 | 0.018 | 0.002 |
| 4.729999999999836 | 0.589 | 0.018 | 0.002 |
| 4.734999999999836 | 0.589 | 0.018 | 0.002 |
| 4.739999999999836 | 0.589 | 0.018 | 0.002 |
| 4.744999999999836 | 0.589 | 0.018 | 0.002 |
| 4.749999999999836 | 0.589 | 0.018 | 0.002 |
| 4.754999999999836 | 0.589 | 0.018 | 0.002 |
| 4.759999999999836 | 0.589 | 0.018 | 0.002 |
| 4.764999999999836 | 0.589 | 0.018 | 0.002 |
| 4.769999999999836 | 0.589 | 0.018 | 0.002 |
| 4.774999999999835 | 0.589 | 0.018 | 0.002 |
| 4.779999999999835 | 0.589 | 0.018 | 0.002 |
| 4.784999999999835 | 0.589 | 0.018 | 0.002 |
| 4.789999999999835 | 0.589 | 0.018 | 0.002 |
| 4.794999999999835 | 0.589 | 0.018 | 0.002 |
| 4.799999999999835 | 0.589 | 0.018 | 0.002 |
| 4.804999999999835 | 0.589 | 0.018 | 0.002 |
| 4.809999999999835 | 0.589 | 0.018 | 0.002 |
| 4.814999999999835 | 0.589 | 0.018 | 0.002 |
| 4.819999999999835 | 0.589 | 0.018 | 0.002 |
| 4.824999999999835 | 0.589 | 0.018 | 0.002 |
| 4.829999999999834 | 0.589 | 0.018 | 0.002 |
| 4.834999999999834 | 0.589 | 0.018 | 0.002 |
| 4.839999999999834 | 0.589 | 0.018 | 0.002 |
| 4.844999999999834 | 0.589 | 0.018 | 0.002 |
| 4.849999999999834 | 0.589 | 0.018 | 0.002 |
| 4.854999999999834 | 0.589 | 0.018 | 0.002 |
| 4.859999999999834 | 0.589 | 0.018 | 0.002 |
| 4.864999999999834 | 0.589 | 0.018 | 0.002 |
| 4.869999999999834 | 0.589 | 0.018 | 0.002 |
| 4.874999999999834 | 0.589 | 0.018 | 0.002 |
| 4.879999999999833 | 0.589 | 0.018 | 0.002 |
| 4.884999999999834 | 0.589 | 0.018 | 0.002 |
| 4.889999999999833 | 0.589 | 0.018 | 0.002 |
| 4.894999999999833 | 0.589 | 0.018 | 0.002 |
| 4.899999999999833 | 0.589 | 0.018 | 0.002 |
| 4.904999999999833 | 0.589 | 0.018 | 0.002 |
| 4.909999999999833 | 0.589 | 0.018 | 0.002 |
| 4.914999999999833 | 0.589 | 0.018 | 0.002 |
| 4.919999999999832 | 0.589 | 0.018 | 0.002 |
| 4.924999999999833 | 0.589 | 0.018 | 0.002 |
| 4.929999999999832 | 0.589 | 0.018 | 0.002 |
| 4.934999999999832 | 0.589 | 0.018 | 0.002 |
| 4.939999999999832 | 0.589 | 0.018 | 0.002 |
| 4.944999999999832 | 0.589 | 0.018 | 0.002 |
| 4.949999999999832 | 0.589 | 0.018 | 0.002 |
| 4.954999999999832 | 0.589 | 0.018 | 0.002 |
| 4.959999999999832 | 0.589 | 0.018 | 0.002 |
| 4.964999999999832 | 0.589 | 0.018 | 0.002 |
| 4.969999999999831 | 0.589 | 0.018 | 0.002 |
| 4.974999999999831 | 0.589 | 0.018 | 0.002 |
| 4.97999999999983 | 0.589 | 0.018 | 0.002 |
| 4.984999999999831 | 0.589 | 0.018 | 0.002 |
| 4.98999999999983 | 0.589 | 0.018 | 0.002 |
| 4.994999999999831 | 0.589 | 0.018 | 0.002 |
| 4.99999999999983 | 0.589 | 0.018 | 0.002 |